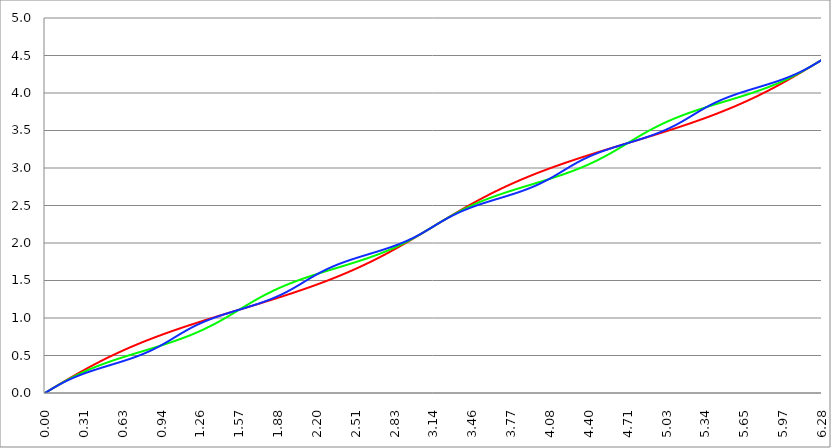
| Category | Series 1 | Series 0 | Series 2 |
|---|---|---|---|
| 0.0 | 0 | 0 | 0 |
| 0.00314159265358979 | 0.003 | 0.003 | 0.003 |
| 0.00628318530717958 | 0.006 | 0.006 | 0.006 |
| 0.00942477796076938 | 0.009 | 0.009 | 0.009 |
| 0.0125663706143592 | 0.013 | 0.013 | 0.013 |
| 0.015707963267949 | 0.016 | 0.016 | 0.016 |
| 0.0188495559215388 | 0.019 | 0.019 | 0.019 |
| 0.0219911485751285 | 0.022 | 0.022 | 0.022 |
| 0.0251327412287183 | 0.025 | 0.025 | 0.025 |
| 0.0282743338823081 | 0.028 | 0.028 | 0.028 |
| 0.0314159265358979 | 0.031 | 0.031 | 0.031 |
| 0.0345575191894877 | 0.035 | 0.035 | 0.034 |
| 0.0376991118430775 | 0.038 | 0.038 | 0.038 |
| 0.0408407044966673 | 0.041 | 0.041 | 0.041 |
| 0.0439822971502571 | 0.044 | 0.044 | 0.044 |
| 0.0471238898038469 | 0.047 | 0.047 | 0.047 |
| 0.0502654824574367 | 0.05 | 0.05 | 0.05 |
| 0.0534070751110265 | 0.053 | 0.053 | 0.053 |
| 0.0565486677646163 | 0.056 | 0.056 | 0.056 |
| 0.059690260418206 | 0.06 | 0.059 | 0.059 |
| 0.0628318530717958 | 0.063 | 0.063 | 0.062 |
| 0.0659734457253856 | 0.066 | 0.066 | 0.065 |
| 0.0691150383789754 | 0.069 | 0.069 | 0.068 |
| 0.0722566310325652 | 0.072 | 0.072 | 0.071 |
| 0.075398223686155 | 0.075 | 0.075 | 0.074 |
| 0.0785398163397448 | 0.078 | 0.078 | 0.077 |
| 0.0816814089933346 | 0.082 | 0.081 | 0.08 |
| 0.0848230016469244 | 0.085 | 0.084 | 0.083 |
| 0.0879645943005142 | 0.088 | 0.087 | 0.086 |
| 0.091106186954104 | 0.091 | 0.09 | 0.089 |
| 0.0942477796076937 | 0.094 | 0.093 | 0.092 |
| 0.0973893722612835 | 0.097 | 0.096 | 0.095 |
| 0.100530964914873 | 0.1 | 0.099 | 0.098 |
| 0.103672557568463 | 0.103 | 0.102 | 0.101 |
| 0.106814150222053 | 0.106 | 0.105 | 0.103 |
| 0.109955742875643 | 0.11 | 0.108 | 0.106 |
| 0.113097335529233 | 0.113 | 0.111 | 0.109 |
| 0.116238928182822 | 0.116 | 0.114 | 0.112 |
| 0.119380520836412 | 0.119 | 0.117 | 0.115 |
| 0.122522113490002 | 0.122 | 0.12 | 0.118 |
| 0.125663706143592 | 0.125 | 0.123 | 0.12 |
| 0.128805298797181 | 0.128 | 0.126 | 0.123 |
| 0.131946891450771 | 0.131 | 0.129 | 0.126 |
| 0.135088484104361 | 0.134 | 0.132 | 0.129 |
| 0.138230076757951 | 0.137 | 0.135 | 0.131 |
| 0.141371669411541 | 0.14 | 0.138 | 0.134 |
| 0.14451326206513 | 0.144 | 0.141 | 0.137 |
| 0.14765485471872 | 0.147 | 0.144 | 0.139 |
| 0.15079644737231 | 0.15 | 0.147 | 0.142 |
| 0.1539380400259 | 0.153 | 0.149 | 0.145 |
| 0.15707963267949 | 0.156 | 0.152 | 0.147 |
| 0.160221225333079 | 0.159 | 0.155 | 0.15 |
| 0.163362817986669 | 0.162 | 0.158 | 0.152 |
| 0.166504410640259 | 0.165 | 0.161 | 0.155 |
| 0.169646003293849 | 0.168 | 0.164 | 0.157 |
| 0.172787595947439 | 0.171 | 0.167 | 0.16 |
| 0.175929188601028 | 0.174 | 0.169 | 0.163 |
| 0.179070781254618 | 0.177 | 0.172 | 0.165 |
| 0.182212373908208 | 0.18 | 0.175 | 0.167 |
| 0.185353966561798 | 0.183 | 0.178 | 0.17 |
| 0.188495559215388 | 0.186 | 0.18 | 0.172 |
| 0.191637151868977 | 0.189 | 0.183 | 0.175 |
| 0.194778744522567 | 0.192 | 0.186 | 0.177 |
| 0.197920337176157 | 0.195 | 0.189 | 0.18 |
| 0.201061929829747 | 0.198 | 0.191 | 0.182 |
| 0.204203522483336 | 0.201 | 0.194 | 0.184 |
| 0.207345115136926 | 0.204 | 0.197 | 0.187 |
| 0.210486707790516 | 0.207 | 0.2 | 0.189 |
| 0.213628300444106 | 0.21 | 0.202 | 0.191 |
| 0.216769893097696 | 0.213 | 0.205 | 0.194 |
| 0.219911485751285 | 0.216 | 0.208 | 0.196 |
| 0.223053078404875 | 0.219 | 0.21 | 0.198 |
| 0.226194671058465 | 0.222 | 0.213 | 0.201 |
| 0.229336263712055 | 0.225 | 0.216 | 0.203 |
| 0.232477856365645 | 0.228 | 0.218 | 0.205 |
| 0.235619449019234 | 0.231 | 0.221 | 0.207 |
| 0.238761041672824 | 0.234 | 0.223 | 0.209 |
| 0.241902634326414 | 0.237 | 0.226 | 0.212 |
| 0.245044226980004 | 0.24 | 0.229 | 0.214 |
| 0.248185819633594 | 0.243 | 0.231 | 0.216 |
| 0.251327412287183 | 0.246 | 0.234 | 0.218 |
| 0.254469004940773 | 0.249 | 0.236 | 0.22 |
| 0.257610597594363 | 0.252 | 0.239 | 0.222 |
| 0.260752190247953 | 0.255 | 0.241 | 0.224 |
| 0.263893782901543 | 0.258 | 0.244 | 0.227 |
| 0.267035375555132 | 0.261 | 0.246 | 0.229 |
| 0.270176968208722 | 0.264 | 0.249 | 0.231 |
| 0.273318560862312 | 0.267 | 0.251 | 0.233 |
| 0.276460153515902 | 0.27 | 0.254 | 0.235 |
| 0.279601746169492 | 0.273 | 0.256 | 0.237 |
| 0.282743338823082 | 0.276 | 0.259 | 0.239 |
| 0.285884931476671 | 0.279 | 0.261 | 0.241 |
| 0.289026524130261 | 0.281 | 0.263 | 0.243 |
| 0.292168116783851 | 0.284 | 0.266 | 0.245 |
| 0.295309709437441 | 0.287 | 0.268 | 0.247 |
| 0.298451302091031 | 0.29 | 0.271 | 0.249 |
| 0.30159289474462 | 0.293 | 0.273 | 0.251 |
| 0.30473448739821 | 0.296 | 0.275 | 0.253 |
| 0.3078760800518 | 0.299 | 0.278 | 0.255 |
| 0.31101767270539 | 0.302 | 0.28 | 0.256 |
| 0.31415926535898 | 0.305 | 0.282 | 0.258 |
| 0.31730085801257 | 0.307 | 0.285 | 0.26 |
| 0.320442450666159 | 0.31 | 0.287 | 0.262 |
| 0.323584043319749 | 0.313 | 0.289 | 0.264 |
| 0.326725635973339 | 0.316 | 0.292 | 0.266 |
| 0.329867228626929 | 0.319 | 0.294 | 0.268 |
| 0.333008821280519 | 0.322 | 0.296 | 0.27 |
| 0.336150413934108 | 0.325 | 0.299 | 0.271 |
| 0.339292006587698 | 0.327 | 0.301 | 0.273 |
| 0.342433599241288 | 0.33 | 0.303 | 0.275 |
| 0.345575191894878 | 0.333 | 0.305 | 0.277 |
| 0.348716784548468 | 0.336 | 0.308 | 0.279 |
| 0.351858377202058 | 0.339 | 0.31 | 0.28 |
| 0.354999969855647 | 0.341 | 0.312 | 0.282 |
| 0.358141562509237 | 0.344 | 0.314 | 0.284 |
| 0.361283155162827 | 0.347 | 0.316 | 0.286 |
| 0.364424747816417 | 0.35 | 0.319 | 0.288 |
| 0.367566340470007 | 0.353 | 0.321 | 0.289 |
| 0.370707933123597 | 0.355 | 0.323 | 0.291 |
| 0.373849525777186 | 0.358 | 0.325 | 0.293 |
| 0.376991118430776 | 0.361 | 0.327 | 0.295 |
| 0.380132711084366 | 0.364 | 0.329 | 0.296 |
| 0.383274303737956 | 0.366 | 0.331 | 0.298 |
| 0.386415896391546 | 0.369 | 0.334 | 0.3 |
| 0.389557489045135 | 0.372 | 0.336 | 0.301 |
| 0.392699081698725 | 0.375 | 0.338 | 0.303 |
| 0.395840674352315 | 0.377 | 0.34 | 0.305 |
| 0.398982267005905 | 0.38 | 0.342 | 0.306 |
| 0.402123859659495 | 0.383 | 0.344 | 0.308 |
| 0.405265452313085 | 0.386 | 0.346 | 0.31 |
| 0.408407044966674 | 0.388 | 0.348 | 0.311 |
| 0.411548637620264 | 0.391 | 0.35 | 0.313 |
| 0.414690230273854 | 0.394 | 0.352 | 0.315 |
| 0.417831822927444 | 0.396 | 0.354 | 0.316 |
| 0.420973415581034 | 0.399 | 0.356 | 0.318 |
| 0.424115008234623 | 0.402 | 0.358 | 0.32 |
| 0.427256600888213 | 0.405 | 0.36 | 0.321 |
| 0.430398193541803 | 0.407 | 0.362 | 0.323 |
| 0.433539786195393 | 0.41 | 0.364 | 0.325 |
| 0.436681378848983 | 0.413 | 0.366 | 0.326 |
| 0.439822971502573 | 0.415 | 0.368 | 0.328 |
| 0.442964564156162 | 0.418 | 0.37 | 0.33 |
| 0.446106156809752 | 0.421 | 0.372 | 0.331 |
| 0.449247749463342 | 0.423 | 0.374 | 0.333 |
| 0.452389342116932 | 0.426 | 0.376 | 0.334 |
| 0.455530934770522 | 0.428 | 0.378 | 0.336 |
| 0.458672527424111 | 0.431 | 0.38 | 0.338 |
| 0.461814120077701 | 0.434 | 0.382 | 0.339 |
| 0.464955712731291 | 0.436 | 0.384 | 0.341 |
| 0.468097305384881 | 0.439 | 0.386 | 0.342 |
| 0.471238898038471 | 0.442 | 0.388 | 0.344 |
| 0.474380490692061 | 0.444 | 0.389 | 0.346 |
| 0.47752208334565 | 0.447 | 0.391 | 0.347 |
| 0.48066367599924 | 0.449 | 0.393 | 0.349 |
| 0.48380526865283 | 0.452 | 0.395 | 0.35 |
| 0.48694686130642 | 0.454 | 0.397 | 0.352 |
| 0.49008845396001 | 0.457 | 0.399 | 0.353 |
| 0.493230046613599 | 0.46 | 0.401 | 0.355 |
| 0.496371639267189 | 0.462 | 0.403 | 0.357 |
| 0.499513231920779 | 0.465 | 0.404 | 0.358 |
| 0.502654824574369 | 0.467 | 0.406 | 0.36 |
| 0.505796417227959 | 0.47 | 0.408 | 0.361 |
| 0.508938009881549 | 0.472 | 0.41 | 0.363 |
| 0.512079602535138 | 0.475 | 0.412 | 0.364 |
| 0.515221195188728 | 0.477 | 0.414 | 0.366 |
| 0.518362787842318 | 0.48 | 0.415 | 0.368 |
| 0.521504380495908 | 0.482 | 0.417 | 0.369 |
| 0.524645973149498 | 0.485 | 0.419 | 0.371 |
| 0.527787565803087 | 0.488 | 0.421 | 0.372 |
| 0.530929158456677 | 0.49 | 0.422 | 0.374 |
| 0.534070751110267 | 0.493 | 0.424 | 0.375 |
| 0.537212343763857 | 0.495 | 0.426 | 0.377 |
| 0.540353936417447 | 0.497 | 0.428 | 0.379 |
| 0.543495529071037 | 0.5 | 0.43 | 0.38 |
| 0.546637121724626 | 0.502 | 0.431 | 0.382 |
| 0.549778714378216 | 0.505 | 0.433 | 0.383 |
| 0.552920307031806 | 0.507 | 0.435 | 0.385 |
| 0.556061899685396 | 0.51 | 0.437 | 0.386 |
| 0.559203492338986 | 0.512 | 0.438 | 0.388 |
| 0.562345084992576 | 0.515 | 0.44 | 0.39 |
| 0.565486677646165 | 0.517 | 0.442 | 0.391 |
| 0.568628270299755 | 0.52 | 0.444 | 0.393 |
| 0.571769862953345 | 0.522 | 0.445 | 0.394 |
| 0.574911455606935 | 0.524 | 0.447 | 0.396 |
| 0.578053048260525 | 0.527 | 0.449 | 0.398 |
| 0.581194640914114 | 0.529 | 0.45 | 0.399 |
| 0.584336233567704 | 0.532 | 0.452 | 0.401 |
| 0.587477826221294 | 0.534 | 0.454 | 0.402 |
| 0.590619418874884 | 0.537 | 0.455 | 0.404 |
| 0.593761011528474 | 0.539 | 0.457 | 0.406 |
| 0.596902604182064 | 0.541 | 0.459 | 0.407 |
| 0.600044196835653 | 0.544 | 0.461 | 0.409 |
| 0.603185789489243 | 0.546 | 0.462 | 0.41 |
| 0.606327382142833 | 0.548 | 0.464 | 0.412 |
| 0.609468974796423 | 0.551 | 0.466 | 0.414 |
| 0.612610567450013 | 0.553 | 0.467 | 0.415 |
| 0.615752160103602 | 0.556 | 0.469 | 0.417 |
| 0.618893752757192 | 0.558 | 0.471 | 0.419 |
| 0.622035345410782 | 0.56 | 0.472 | 0.42 |
| 0.625176938064372 | 0.563 | 0.474 | 0.422 |
| 0.628318530717962 | 0.565 | 0.476 | 0.423 |
| 0.631460123371551 | 0.567 | 0.477 | 0.425 |
| 0.634601716025141 | 0.57 | 0.479 | 0.427 |
| 0.637743308678731 | 0.572 | 0.48 | 0.428 |
| 0.640884901332321 | 0.574 | 0.482 | 0.43 |
| 0.644026493985911 | 0.577 | 0.484 | 0.432 |
| 0.647168086639501 | 0.579 | 0.485 | 0.433 |
| 0.65030967929309 | 0.581 | 0.487 | 0.435 |
| 0.65345127194668 | 0.583 | 0.489 | 0.437 |
| 0.65659286460027 | 0.586 | 0.49 | 0.439 |
| 0.65973445725386 | 0.588 | 0.492 | 0.44 |
| 0.66287604990745 | 0.59 | 0.493 | 0.442 |
| 0.666017642561039 | 0.593 | 0.495 | 0.444 |
| 0.669159235214629 | 0.595 | 0.497 | 0.445 |
| 0.672300827868219 | 0.597 | 0.498 | 0.447 |
| 0.675442420521809 | 0.599 | 0.5 | 0.449 |
| 0.678584013175399 | 0.602 | 0.502 | 0.451 |
| 0.681725605828989 | 0.604 | 0.503 | 0.452 |
| 0.684867198482578 | 0.606 | 0.505 | 0.454 |
| 0.688008791136168 | 0.608 | 0.506 | 0.456 |
| 0.691150383789758 | 0.611 | 0.508 | 0.458 |
| 0.694291976443348 | 0.613 | 0.51 | 0.459 |
| 0.697433569096938 | 0.615 | 0.511 | 0.461 |
| 0.700575161750528 | 0.617 | 0.513 | 0.463 |
| 0.703716754404117 | 0.62 | 0.514 | 0.465 |
| 0.706858347057707 | 0.622 | 0.516 | 0.467 |
| 0.709999939711297 | 0.624 | 0.518 | 0.468 |
| 0.713141532364887 | 0.626 | 0.519 | 0.47 |
| 0.716283125018477 | 0.628 | 0.521 | 0.472 |
| 0.719424717672066 | 0.631 | 0.522 | 0.474 |
| 0.722566310325656 | 0.633 | 0.524 | 0.476 |
| 0.725707902979246 | 0.635 | 0.525 | 0.478 |
| 0.728849495632836 | 0.637 | 0.527 | 0.48 |
| 0.731991088286426 | 0.639 | 0.529 | 0.481 |
| 0.735132680940016 | 0.641 | 0.53 | 0.483 |
| 0.738274273593605 | 0.644 | 0.532 | 0.485 |
| 0.741415866247195 | 0.646 | 0.533 | 0.487 |
| 0.744557458900785 | 0.648 | 0.535 | 0.489 |
| 0.747699051554375 | 0.65 | 0.536 | 0.491 |
| 0.750840644207965 | 0.652 | 0.538 | 0.493 |
| 0.753982236861554 | 0.654 | 0.54 | 0.495 |
| 0.757123829515144 | 0.656 | 0.541 | 0.497 |
| 0.760265422168734 | 0.659 | 0.543 | 0.499 |
| 0.763407014822324 | 0.661 | 0.544 | 0.501 |
| 0.766548607475914 | 0.663 | 0.546 | 0.503 |
| 0.769690200129504 | 0.665 | 0.548 | 0.505 |
| 0.772831792783093 | 0.667 | 0.549 | 0.507 |
| 0.775973385436683 | 0.669 | 0.551 | 0.509 |
| 0.779114978090273 | 0.671 | 0.552 | 0.511 |
| 0.782256570743863 | 0.673 | 0.554 | 0.513 |
| 0.785398163397453 | 0.676 | 0.555 | 0.515 |
| 0.788539756051042 | 0.678 | 0.557 | 0.517 |
| 0.791681348704632 | 0.68 | 0.559 | 0.52 |
| 0.794822941358222 | 0.682 | 0.56 | 0.522 |
| 0.797964534011812 | 0.684 | 0.562 | 0.524 |
| 0.801106126665402 | 0.686 | 0.563 | 0.526 |
| 0.804247719318992 | 0.688 | 0.565 | 0.528 |
| 0.807389311972581 | 0.69 | 0.566 | 0.53 |
| 0.810530904626171 | 0.692 | 0.568 | 0.533 |
| 0.813672497279761 | 0.694 | 0.57 | 0.535 |
| 0.816814089933351 | 0.696 | 0.571 | 0.537 |
| 0.819955682586941 | 0.698 | 0.573 | 0.539 |
| 0.823097275240531 | 0.7 | 0.574 | 0.541 |
| 0.82623886789412 | 0.702 | 0.576 | 0.544 |
| 0.82938046054771 | 0.704 | 0.577 | 0.546 |
| 0.8325220532013 | 0.706 | 0.579 | 0.548 |
| 0.83566364585489 | 0.708 | 0.581 | 0.551 |
| 0.83880523850848 | 0.71 | 0.582 | 0.553 |
| 0.841946831162069 | 0.713 | 0.584 | 0.555 |
| 0.845088423815659 | 0.715 | 0.585 | 0.558 |
| 0.848230016469249 | 0.717 | 0.587 | 0.56 |
| 0.851371609122839 | 0.719 | 0.588 | 0.562 |
| 0.854513201776429 | 0.721 | 0.59 | 0.565 |
| 0.857654794430019 | 0.723 | 0.592 | 0.567 |
| 0.860796387083608 | 0.725 | 0.593 | 0.57 |
| 0.863937979737198 | 0.727 | 0.595 | 0.572 |
| 0.867079572390788 | 0.729 | 0.596 | 0.575 |
| 0.870221165044378 | 0.731 | 0.598 | 0.577 |
| 0.873362757697968 | 0.733 | 0.6 | 0.58 |
| 0.876504350351557 | 0.734 | 0.601 | 0.582 |
| 0.879645943005147 | 0.736 | 0.603 | 0.585 |
| 0.882787535658737 | 0.738 | 0.604 | 0.587 |
| 0.885929128312327 | 0.74 | 0.606 | 0.59 |
| 0.889070720965917 | 0.742 | 0.608 | 0.592 |
| 0.892212313619507 | 0.744 | 0.609 | 0.595 |
| 0.895353906273096 | 0.746 | 0.611 | 0.598 |
| 0.898495498926686 | 0.748 | 0.612 | 0.6 |
| 0.901637091580276 | 0.75 | 0.614 | 0.603 |
| 0.904778684233866 | 0.752 | 0.616 | 0.606 |
| 0.907920276887456 | 0.754 | 0.617 | 0.608 |
| 0.911061869541045 | 0.756 | 0.619 | 0.611 |
| 0.914203462194635 | 0.758 | 0.62 | 0.614 |
| 0.917345054848225 | 0.76 | 0.622 | 0.616 |
| 0.920486647501815 | 0.762 | 0.624 | 0.619 |
| 0.923628240155405 | 0.764 | 0.625 | 0.622 |
| 0.926769832808995 | 0.766 | 0.627 | 0.625 |
| 0.929911425462584 | 0.768 | 0.629 | 0.628 |
| 0.933053018116174 | 0.769 | 0.63 | 0.63 |
| 0.936194610769764 | 0.771 | 0.632 | 0.633 |
| 0.939336203423354 | 0.773 | 0.634 | 0.636 |
| 0.942477796076944 | 0.775 | 0.635 | 0.639 |
| 0.945619388730533 | 0.777 | 0.637 | 0.642 |
| 0.948760981384123 | 0.779 | 0.639 | 0.645 |
| 0.951902574037713 | 0.781 | 0.64 | 0.648 |
| 0.955044166691303 | 0.783 | 0.642 | 0.651 |
| 0.958185759344893 | 0.785 | 0.643 | 0.653 |
| 0.961327351998483 | 0.786 | 0.645 | 0.656 |
| 0.964468944652072 | 0.788 | 0.647 | 0.659 |
| 0.967610537305662 | 0.79 | 0.649 | 0.662 |
| 0.970752129959252 | 0.792 | 0.65 | 0.665 |
| 0.973893722612842 | 0.794 | 0.652 | 0.668 |
| 0.977035315266432 | 0.796 | 0.654 | 0.671 |
| 0.980176907920022 | 0.798 | 0.655 | 0.674 |
| 0.983318500573611 | 0.8 | 0.657 | 0.677 |
| 0.986460093227201 | 0.801 | 0.659 | 0.68 |
| 0.989601685880791 | 0.803 | 0.66 | 0.683 |
| 0.992743278534381 | 0.805 | 0.662 | 0.687 |
| 0.995884871187971 | 0.807 | 0.664 | 0.69 |
| 0.99902646384156 | 0.809 | 0.665 | 0.693 |
| 1.00216805649515 | 0.811 | 0.667 | 0.696 |
| 1.00530964914874 | 0.812 | 0.669 | 0.699 |
| 1.00845124180233 | 0.814 | 0.671 | 0.702 |
| 1.01159283445592 | 0.816 | 0.672 | 0.705 |
| 1.01473442710951 | 0.818 | 0.674 | 0.708 |
| 1.017876019763099 | 0.82 | 0.676 | 0.711 |
| 1.021017612416689 | 0.822 | 0.678 | 0.714 |
| 1.02415920507028 | 0.823 | 0.679 | 0.717 |
| 1.027300797723869 | 0.825 | 0.681 | 0.721 |
| 1.030442390377459 | 0.827 | 0.683 | 0.724 |
| 1.033583983031048 | 0.829 | 0.685 | 0.727 |
| 1.036725575684638 | 0.831 | 0.686 | 0.73 |
| 1.039867168338228 | 0.832 | 0.688 | 0.733 |
| 1.043008760991818 | 0.834 | 0.69 | 0.736 |
| 1.046150353645408 | 0.836 | 0.692 | 0.739 |
| 1.049291946298998 | 0.838 | 0.694 | 0.743 |
| 1.052433538952587 | 0.84 | 0.695 | 0.746 |
| 1.055575131606177 | 0.841 | 0.697 | 0.749 |
| 1.058716724259767 | 0.843 | 0.699 | 0.752 |
| 1.061858316913357 | 0.845 | 0.701 | 0.755 |
| 1.064999909566947 | 0.847 | 0.703 | 0.758 |
| 1.068141502220536 | 0.849 | 0.704 | 0.761 |
| 1.071283094874126 | 0.85 | 0.706 | 0.765 |
| 1.074424687527716 | 0.852 | 0.708 | 0.768 |
| 1.077566280181306 | 0.854 | 0.71 | 0.771 |
| 1.080707872834896 | 0.856 | 0.712 | 0.774 |
| 1.083849465488486 | 0.857 | 0.714 | 0.777 |
| 1.086991058142075 | 0.859 | 0.716 | 0.78 |
| 1.090132650795665 | 0.861 | 0.717 | 0.783 |
| 1.093274243449255 | 0.863 | 0.719 | 0.786 |
| 1.096415836102845 | 0.864 | 0.721 | 0.789 |
| 1.099557428756435 | 0.866 | 0.723 | 0.792 |
| 1.102699021410025 | 0.868 | 0.725 | 0.795 |
| 1.105840614063614 | 0.87 | 0.727 | 0.799 |
| 1.108982206717204 | 0.871 | 0.729 | 0.802 |
| 1.112123799370794 | 0.873 | 0.731 | 0.805 |
| 1.115265392024384 | 0.875 | 0.733 | 0.808 |
| 1.118406984677974 | 0.877 | 0.735 | 0.811 |
| 1.121548577331563 | 0.878 | 0.737 | 0.814 |
| 1.124690169985153 | 0.88 | 0.739 | 0.817 |
| 1.127831762638743 | 0.882 | 0.741 | 0.82 |
| 1.130973355292333 | 0.884 | 0.742 | 0.823 |
| 1.134114947945923 | 0.885 | 0.744 | 0.826 |
| 1.137256540599513 | 0.887 | 0.746 | 0.828 |
| 1.140398133253102 | 0.889 | 0.748 | 0.831 |
| 1.143539725906692 | 0.89 | 0.75 | 0.834 |
| 1.146681318560282 | 0.892 | 0.752 | 0.837 |
| 1.149822911213872 | 0.894 | 0.754 | 0.84 |
| 1.152964503867462 | 0.896 | 0.756 | 0.843 |
| 1.156106096521051 | 0.897 | 0.759 | 0.846 |
| 1.159247689174641 | 0.899 | 0.761 | 0.849 |
| 1.162389281828231 | 0.901 | 0.763 | 0.851 |
| 1.165530874481821 | 0.902 | 0.765 | 0.854 |
| 1.168672467135411 | 0.904 | 0.767 | 0.857 |
| 1.171814059789001 | 0.906 | 0.769 | 0.86 |
| 1.17495565244259 | 0.908 | 0.771 | 0.863 |
| 1.17809724509618 | 0.909 | 0.773 | 0.865 |
| 1.18123883774977 | 0.911 | 0.775 | 0.868 |
| 1.18438043040336 | 0.913 | 0.777 | 0.871 |
| 1.18752202305695 | 0.914 | 0.779 | 0.874 |
| 1.190663615710539 | 0.916 | 0.781 | 0.876 |
| 1.193805208364129 | 0.918 | 0.784 | 0.879 |
| 1.19694680101772 | 0.919 | 0.786 | 0.882 |
| 1.200088393671309 | 0.921 | 0.788 | 0.884 |
| 1.203229986324899 | 0.923 | 0.79 | 0.887 |
| 1.206371578978489 | 0.924 | 0.792 | 0.889 |
| 1.209513171632078 | 0.926 | 0.794 | 0.892 |
| 1.212654764285668 | 0.928 | 0.797 | 0.895 |
| 1.215796356939258 | 0.929 | 0.799 | 0.897 |
| 1.218937949592848 | 0.931 | 0.801 | 0.9 |
| 1.222079542246438 | 0.933 | 0.803 | 0.902 |
| 1.225221134900027 | 0.934 | 0.805 | 0.905 |
| 1.228362727553617 | 0.936 | 0.808 | 0.907 |
| 1.231504320207207 | 0.938 | 0.81 | 0.91 |
| 1.234645912860797 | 0.939 | 0.812 | 0.912 |
| 1.237787505514387 | 0.941 | 0.814 | 0.915 |
| 1.240929098167977 | 0.943 | 0.817 | 0.917 |
| 1.244070690821566 | 0.944 | 0.819 | 0.919 |
| 1.247212283475156 | 0.946 | 0.821 | 0.922 |
| 1.250353876128746 | 0.948 | 0.824 | 0.924 |
| 1.253495468782336 | 0.949 | 0.826 | 0.926 |
| 1.256637061435926 | 0.951 | 0.828 | 0.929 |
| 1.259778654089515 | 0.953 | 0.831 | 0.931 |
| 1.262920246743105 | 0.954 | 0.833 | 0.933 |
| 1.266061839396695 | 0.956 | 0.835 | 0.936 |
| 1.269203432050285 | 0.958 | 0.838 | 0.938 |
| 1.272345024703875 | 0.959 | 0.84 | 0.94 |
| 1.275486617357465 | 0.961 | 0.842 | 0.943 |
| 1.278628210011054 | 0.963 | 0.845 | 0.945 |
| 1.281769802664644 | 0.964 | 0.847 | 0.947 |
| 1.284911395318234 | 0.966 | 0.85 | 0.949 |
| 1.288052987971824 | 0.967 | 0.852 | 0.951 |
| 1.291194580625414 | 0.969 | 0.855 | 0.954 |
| 1.294336173279003 | 0.971 | 0.857 | 0.956 |
| 1.297477765932593 | 0.972 | 0.859 | 0.958 |
| 1.300619358586183 | 0.974 | 0.862 | 0.96 |
| 1.303760951239773 | 0.976 | 0.864 | 0.962 |
| 1.306902543893363 | 0.977 | 0.867 | 0.964 |
| 1.310044136546953 | 0.979 | 0.869 | 0.966 |
| 1.313185729200542 | 0.98 | 0.872 | 0.968 |
| 1.316327321854132 | 0.982 | 0.875 | 0.971 |
| 1.319468914507722 | 0.984 | 0.877 | 0.973 |
| 1.322610507161312 | 0.985 | 0.88 | 0.975 |
| 1.325752099814902 | 0.987 | 0.882 | 0.977 |
| 1.328893692468491 | 0.989 | 0.885 | 0.979 |
| 1.332035285122081 | 0.99 | 0.887 | 0.981 |
| 1.335176877775671 | 0.992 | 0.89 | 0.983 |
| 1.338318470429261 | 0.993 | 0.893 | 0.985 |
| 1.341460063082851 | 0.995 | 0.895 | 0.987 |
| 1.344601655736441 | 0.997 | 0.898 | 0.989 |
| 1.34774324839003 | 0.998 | 0.9 | 0.991 |
| 1.35088484104362 | 1 | 0.903 | 0.992 |
| 1.35402643369721 | 1.001 | 0.906 | 0.994 |
| 1.3571680263508 | 1.003 | 0.908 | 0.996 |
| 1.36030961900439 | 1.005 | 0.911 | 0.998 |
| 1.363451211657979 | 1.006 | 0.914 | 1 |
| 1.36659280431157 | 1.008 | 0.917 | 1.002 |
| 1.369734396965159 | 1.01 | 0.919 | 1.004 |
| 1.372875989618749 | 1.011 | 0.922 | 1.006 |
| 1.376017582272339 | 1.013 | 0.925 | 1.008 |
| 1.379159174925929 | 1.014 | 0.927 | 1.009 |
| 1.382300767579518 | 1.016 | 0.93 | 1.011 |
| 1.385442360233108 | 1.018 | 0.933 | 1.013 |
| 1.388583952886698 | 1.019 | 0.936 | 1.015 |
| 1.391725545540288 | 1.021 | 0.939 | 1.017 |
| 1.394867138193878 | 1.022 | 0.941 | 1.019 |
| 1.398008730847468 | 1.024 | 0.944 | 1.02 |
| 1.401150323501057 | 1.025 | 0.947 | 1.022 |
| 1.404291916154647 | 1.027 | 0.95 | 1.024 |
| 1.407433508808237 | 1.029 | 0.953 | 1.026 |
| 1.410575101461827 | 1.03 | 0.956 | 1.027 |
| 1.413716694115417 | 1.032 | 0.958 | 1.029 |
| 1.416858286769006 | 1.033 | 0.961 | 1.031 |
| 1.419999879422596 | 1.035 | 0.964 | 1.033 |
| 1.423141472076186 | 1.037 | 0.967 | 1.034 |
| 1.426283064729776 | 1.038 | 0.97 | 1.036 |
| 1.429424657383366 | 1.04 | 0.973 | 1.038 |
| 1.432566250036956 | 1.041 | 0.976 | 1.04 |
| 1.435707842690545 | 1.043 | 0.979 | 1.041 |
| 1.438849435344135 | 1.045 | 0.982 | 1.043 |
| 1.441991027997725 | 1.046 | 0.985 | 1.045 |
| 1.445132620651315 | 1.048 | 0.988 | 1.046 |
| 1.448274213304905 | 1.049 | 0.991 | 1.048 |
| 1.451415805958494 | 1.051 | 0.994 | 1.05 |
| 1.454557398612084 | 1.052 | 0.996 | 1.051 |
| 1.457698991265674 | 1.054 | 0.999 | 1.053 |
| 1.460840583919264 | 1.056 | 1.002 | 1.055 |
| 1.463982176572854 | 1.057 | 1.005 | 1.056 |
| 1.467123769226444 | 1.059 | 1.008 | 1.058 |
| 1.470265361880033 | 1.06 | 1.012 | 1.06 |
| 1.473406954533623 | 1.062 | 1.015 | 1.061 |
| 1.476548547187213 | 1.064 | 1.018 | 1.063 |
| 1.479690139840803 | 1.065 | 1.021 | 1.065 |
| 1.482831732494393 | 1.067 | 1.024 | 1.066 |
| 1.485973325147982 | 1.068 | 1.027 | 1.068 |
| 1.489114917801572 | 1.07 | 1.03 | 1.069 |
| 1.492256510455162 | 1.071 | 1.033 | 1.071 |
| 1.495398103108752 | 1.073 | 1.036 | 1.073 |
| 1.498539695762342 | 1.075 | 1.039 | 1.074 |
| 1.501681288415932 | 1.076 | 1.042 | 1.076 |
| 1.504822881069521 | 1.078 | 1.045 | 1.078 |
| 1.507964473723111 | 1.079 | 1.048 | 1.079 |
| 1.511106066376701 | 1.081 | 1.051 | 1.081 |
| 1.514247659030291 | 1.082 | 1.054 | 1.082 |
| 1.517389251683881 | 1.084 | 1.058 | 1.084 |
| 1.520530844337471 | 1.086 | 1.061 | 1.085 |
| 1.52367243699106 | 1.087 | 1.064 | 1.087 |
| 1.52681402964465 | 1.089 | 1.067 | 1.089 |
| 1.52995562229824 | 1.09 | 1.07 | 1.09 |
| 1.53309721495183 | 1.092 | 1.073 | 1.092 |
| 1.53623880760542 | 1.093 | 1.076 | 1.093 |
| 1.539380400259009 | 1.095 | 1.079 | 1.095 |
| 1.542521992912599 | 1.097 | 1.082 | 1.097 |
| 1.545663585566189 | 1.098 | 1.086 | 1.098 |
| 1.548805178219779 | 1.1 | 1.089 | 1.1 |
| 1.551946770873369 | 1.101 | 1.092 | 1.101 |
| 1.555088363526959 | 1.103 | 1.095 | 1.103 |
| 1.558229956180548 | 1.104 | 1.098 | 1.104 |
| 1.561371548834138 | 1.106 | 1.101 | 1.106 |
| 1.564513141487728 | 1.108 | 1.104 | 1.108 |
| 1.567654734141318 | 1.109 | 1.108 | 1.109 |
| 1.570796326794908 | 1.111 | 1.111 | 1.111 |
| 1.573937919448497 | 1.112 | 1.114 | 1.112 |
| 1.577079512102087 | 1.114 | 1.117 | 1.114 |
| 1.580221104755677 | 1.115 | 1.12 | 1.115 |
| 1.583362697409267 | 1.117 | 1.123 | 1.117 |
| 1.586504290062857 | 1.119 | 1.126 | 1.119 |
| 1.589645882716447 | 1.12 | 1.13 | 1.12 |
| 1.592787475370036 | 1.122 | 1.133 | 1.122 |
| 1.595929068023626 | 1.123 | 1.136 | 1.123 |
| 1.599070660677216 | 1.125 | 1.139 | 1.125 |
| 1.602212253330806 | 1.126 | 1.142 | 1.126 |
| 1.605353845984396 | 1.128 | 1.145 | 1.128 |
| 1.608495438637985 | 1.13 | 1.148 | 1.13 |
| 1.611637031291575 | 1.131 | 1.151 | 1.131 |
| 1.614778623945165 | 1.133 | 1.155 | 1.133 |
| 1.617920216598755 | 1.134 | 1.158 | 1.134 |
| 1.621061809252345 | 1.136 | 1.161 | 1.136 |
| 1.624203401905935 | 1.137 | 1.164 | 1.138 |
| 1.627344994559524 | 1.139 | 1.167 | 1.139 |
| 1.630486587213114 | 1.141 | 1.17 | 1.141 |
| 1.633628179866704 | 1.142 | 1.173 | 1.142 |
| 1.636769772520294 | 1.144 | 1.176 | 1.144 |
| 1.639911365173884 | 1.145 | 1.179 | 1.146 |
| 1.643052957827473 | 1.147 | 1.182 | 1.147 |
| 1.646194550481063 | 1.148 | 1.186 | 1.149 |
| 1.649336143134653 | 1.15 | 1.189 | 1.15 |
| 1.652477735788243 | 1.152 | 1.192 | 1.152 |
| 1.655619328441833 | 1.153 | 1.195 | 1.154 |
| 1.658760921095423 | 1.155 | 1.198 | 1.155 |
| 1.661902513749012 | 1.156 | 1.201 | 1.157 |
| 1.665044106402602 | 1.158 | 1.204 | 1.158 |
| 1.668185699056192 | 1.159 | 1.207 | 1.16 |
| 1.671327291709782 | 1.161 | 1.21 | 1.162 |
| 1.674468884363372 | 1.163 | 1.213 | 1.163 |
| 1.677610477016961 | 1.164 | 1.216 | 1.165 |
| 1.680752069670551 | 1.166 | 1.219 | 1.167 |
| 1.683893662324141 | 1.167 | 1.222 | 1.168 |
| 1.687035254977731 | 1.169 | 1.225 | 1.17 |
| 1.690176847631321 | 1.171 | 1.228 | 1.172 |
| 1.693318440284911 | 1.172 | 1.231 | 1.173 |
| 1.6964600329385 | 1.174 | 1.234 | 1.175 |
| 1.69960162559209 | 1.175 | 1.237 | 1.177 |
| 1.70274321824568 | 1.177 | 1.24 | 1.178 |
| 1.70588481089927 | 1.178 | 1.243 | 1.18 |
| 1.70902640355286 | 1.18 | 1.246 | 1.182 |
| 1.712167996206449 | 1.182 | 1.249 | 1.184 |
| 1.715309588860039 | 1.183 | 1.251 | 1.185 |
| 1.71845118151363 | 1.185 | 1.254 | 1.187 |
| 1.721592774167219 | 1.186 | 1.257 | 1.189 |
| 1.724734366820809 | 1.188 | 1.26 | 1.19 |
| 1.727875959474399 | 1.19 | 1.263 | 1.192 |
| 1.731017552127988 | 1.191 | 1.266 | 1.194 |
| 1.734159144781578 | 1.193 | 1.269 | 1.196 |
| 1.737300737435168 | 1.194 | 1.272 | 1.198 |
| 1.740442330088758 | 1.196 | 1.274 | 1.199 |
| 1.743583922742348 | 1.198 | 1.277 | 1.201 |
| 1.746725515395937 | 1.199 | 1.28 | 1.203 |
| 1.749867108049527 | 1.201 | 1.283 | 1.205 |
| 1.753008700703117 | 1.202 | 1.286 | 1.206 |
| 1.756150293356707 | 1.204 | 1.288 | 1.208 |
| 1.759291886010297 | 1.206 | 1.291 | 1.21 |
| 1.762433478663887 | 1.207 | 1.294 | 1.212 |
| 1.765575071317476 | 1.209 | 1.297 | 1.214 |
| 1.768716663971066 | 1.21 | 1.299 | 1.216 |
| 1.771858256624656 | 1.212 | 1.302 | 1.218 |
| 1.774999849278246 | 1.214 | 1.305 | 1.219 |
| 1.778141441931836 | 1.215 | 1.308 | 1.221 |
| 1.781283034585426 | 1.217 | 1.31 | 1.223 |
| 1.784424627239015 | 1.218 | 1.313 | 1.225 |
| 1.787566219892605 | 1.22 | 1.316 | 1.227 |
| 1.790707812546195 | 1.222 | 1.318 | 1.229 |
| 1.793849405199785 | 1.223 | 1.321 | 1.231 |
| 1.796990997853375 | 1.225 | 1.324 | 1.233 |
| 1.800132590506964 | 1.226 | 1.326 | 1.235 |
| 1.803274183160554 | 1.228 | 1.329 | 1.237 |
| 1.806415775814144 | 1.23 | 1.331 | 1.239 |
| 1.809557368467734 | 1.231 | 1.334 | 1.241 |
| 1.812698961121324 | 1.233 | 1.337 | 1.243 |
| 1.815840553774914 | 1.234 | 1.339 | 1.245 |
| 1.818982146428503 | 1.236 | 1.342 | 1.247 |
| 1.822123739082093 | 1.238 | 1.344 | 1.249 |
| 1.825265331735683 | 1.239 | 1.347 | 1.251 |
| 1.828406924389273 | 1.241 | 1.349 | 1.253 |
| 1.831548517042863 | 1.243 | 1.352 | 1.255 |
| 1.834690109696452 | 1.244 | 1.354 | 1.257 |
| 1.837831702350042 | 1.246 | 1.357 | 1.259 |
| 1.840973295003632 | 1.247 | 1.359 | 1.261 |
| 1.844114887657222 | 1.249 | 1.362 | 1.264 |
| 1.847256480310812 | 1.251 | 1.364 | 1.266 |
| 1.850398072964402 | 1.252 | 1.367 | 1.268 |
| 1.853539665617991 | 1.254 | 1.369 | 1.27 |
| 1.856681258271581 | 1.256 | 1.372 | 1.272 |
| 1.859822850925171 | 1.257 | 1.374 | 1.274 |
| 1.862964443578761 | 1.259 | 1.377 | 1.277 |
| 1.866106036232351 | 1.261 | 1.379 | 1.279 |
| 1.86924762888594 | 1.262 | 1.381 | 1.281 |
| 1.87238922153953 | 1.264 | 1.384 | 1.283 |
| 1.87553081419312 | 1.265 | 1.386 | 1.286 |
| 1.87867240684671 | 1.267 | 1.389 | 1.288 |
| 1.8818139995003 | 1.269 | 1.391 | 1.29 |
| 1.88495559215389 | 1.27 | 1.393 | 1.293 |
| 1.888097184807479 | 1.272 | 1.396 | 1.295 |
| 1.891238777461069 | 1.274 | 1.398 | 1.297 |
| 1.89438037011466 | 1.275 | 1.4 | 1.3 |
| 1.897521962768249 | 1.277 | 1.402 | 1.302 |
| 1.900663555421839 | 1.279 | 1.405 | 1.305 |
| 1.903805148075429 | 1.28 | 1.407 | 1.307 |
| 1.906946740729018 | 1.282 | 1.409 | 1.309 |
| 1.910088333382608 | 1.284 | 1.412 | 1.312 |
| 1.913229926036198 | 1.285 | 1.414 | 1.314 |
| 1.916371518689788 | 1.287 | 1.416 | 1.317 |
| 1.919513111343378 | 1.289 | 1.418 | 1.319 |
| 1.922654703996967 | 1.29 | 1.42 | 1.322 |
| 1.925796296650557 | 1.292 | 1.423 | 1.324 |
| 1.928937889304147 | 1.294 | 1.425 | 1.327 |
| 1.932079481957737 | 1.295 | 1.427 | 1.329 |
| 1.935221074611327 | 1.297 | 1.429 | 1.332 |
| 1.938362667264917 | 1.299 | 1.431 | 1.335 |
| 1.941504259918506 | 1.3 | 1.434 | 1.337 |
| 1.944645852572096 | 1.302 | 1.436 | 1.34 |
| 1.947787445225686 | 1.304 | 1.438 | 1.343 |
| 1.950929037879276 | 1.305 | 1.44 | 1.345 |
| 1.954070630532866 | 1.307 | 1.442 | 1.348 |
| 1.957212223186455 | 1.309 | 1.444 | 1.351 |
| 1.960353815840045 | 1.31 | 1.446 | 1.353 |
| 1.963495408493635 | 1.312 | 1.448 | 1.356 |
| 1.966637001147225 | 1.314 | 1.451 | 1.359 |
| 1.969778593800815 | 1.316 | 1.453 | 1.362 |
| 1.972920186454405 | 1.317 | 1.455 | 1.364 |
| 1.976061779107994 | 1.319 | 1.457 | 1.367 |
| 1.979203371761584 | 1.321 | 1.459 | 1.37 |
| 1.982344964415174 | 1.322 | 1.461 | 1.373 |
| 1.985486557068764 | 1.324 | 1.463 | 1.376 |
| 1.988628149722354 | 1.326 | 1.465 | 1.378 |
| 1.991769742375943 | 1.328 | 1.467 | 1.381 |
| 1.994911335029533 | 1.329 | 1.469 | 1.384 |
| 1.998052927683123 | 1.331 | 1.471 | 1.387 |
| 2.001194520336712 | 1.333 | 1.473 | 1.39 |
| 2.004336112990302 | 1.334 | 1.475 | 1.393 |
| 2.007477705643892 | 1.336 | 1.477 | 1.396 |
| 2.010619298297482 | 1.338 | 1.479 | 1.399 |
| 2.013760890951071 | 1.34 | 1.481 | 1.402 |
| 2.016902483604661 | 1.341 | 1.483 | 1.405 |
| 2.02004407625825 | 1.343 | 1.485 | 1.408 |
| 2.02318566891184 | 1.345 | 1.487 | 1.411 |
| 2.02632726156543 | 1.347 | 1.489 | 1.414 |
| 2.029468854219019 | 1.348 | 1.491 | 1.417 |
| 2.032610446872609 | 1.35 | 1.493 | 1.42 |
| 2.035752039526198 | 1.352 | 1.494 | 1.423 |
| 2.038893632179788 | 1.353 | 1.496 | 1.426 |
| 2.042035224833378 | 1.355 | 1.498 | 1.429 |
| 2.045176817486967 | 1.357 | 1.5 | 1.432 |
| 2.048318410140557 | 1.359 | 1.502 | 1.435 |
| 2.051460002794146 | 1.361 | 1.504 | 1.438 |
| 2.054601595447736 | 1.362 | 1.506 | 1.441 |
| 2.057743188101325 | 1.364 | 1.508 | 1.444 |
| 2.060884780754915 | 1.366 | 1.51 | 1.448 |
| 2.064026373408505 | 1.368 | 1.511 | 1.451 |
| 2.067167966062094 | 1.369 | 1.513 | 1.454 |
| 2.070309558715684 | 1.371 | 1.515 | 1.457 |
| 2.073451151369273 | 1.373 | 1.517 | 1.46 |
| 2.076592744022863 | 1.375 | 1.519 | 1.463 |
| 2.079734336676452 | 1.376 | 1.521 | 1.466 |
| 2.082875929330042 | 1.378 | 1.522 | 1.469 |
| 2.086017521983632 | 1.38 | 1.524 | 1.473 |
| 2.089159114637221 | 1.382 | 1.526 | 1.476 |
| 2.092300707290811 | 1.384 | 1.528 | 1.479 |
| 2.095442299944401 | 1.385 | 1.53 | 1.482 |
| 2.09858389259799 | 1.387 | 1.531 | 1.485 |
| 2.10172548525158 | 1.389 | 1.533 | 1.488 |
| 2.104867077905169 | 1.391 | 1.535 | 1.491 |
| 2.108008670558759 | 1.393 | 1.537 | 1.495 |
| 2.111150263212349 | 1.394 | 1.539 | 1.498 |
| 2.114291855865938 | 1.396 | 1.54 | 1.501 |
| 2.117433448519528 | 1.398 | 1.542 | 1.504 |
| 2.120575041173117 | 1.4 | 1.544 | 1.507 |
| 2.123716633826707 | 1.402 | 1.546 | 1.51 |
| 2.126858226480297 | 1.403 | 1.547 | 1.513 |
| 2.129999819133886 | 1.405 | 1.549 | 1.516 |
| 2.133141411787476 | 1.407 | 1.551 | 1.52 |
| 2.136283004441065 | 1.409 | 1.553 | 1.523 |
| 2.139424597094655 | 1.411 | 1.554 | 1.526 |
| 2.142566189748245 | 1.413 | 1.556 | 1.529 |
| 2.145707782401834 | 1.415 | 1.558 | 1.532 |
| 2.148849375055424 | 1.416 | 1.559 | 1.535 |
| 2.151990967709013 | 1.418 | 1.561 | 1.538 |
| 2.155132560362603 | 1.42 | 1.563 | 1.541 |
| 2.158274153016193 | 1.422 | 1.564 | 1.544 |
| 2.161415745669782 | 1.424 | 1.566 | 1.547 |
| 2.164557338323372 | 1.426 | 1.568 | 1.55 |
| 2.167698930976961 | 1.427 | 1.57 | 1.553 |
| 2.170840523630551 | 1.429 | 1.571 | 1.556 |
| 2.173982116284141 | 1.431 | 1.573 | 1.559 |
| 2.17712370893773 | 1.433 | 1.575 | 1.562 |
| 2.18026530159132 | 1.435 | 1.576 | 1.565 |
| 2.183406894244909 | 1.437 | 1.578 | 1.568 |
| 2.186548486898499 | 1.439 | 1.58 | 1.571 |
| 2.189690079552089 | 1.441 | 1.581 | 1.574 |
| 2.192831672205678 | 1.443 | 1.583 | 1.577 |
| 2.195973264859268 | 1.444 | 1.585 | 1.58 |
| 2.199114857512857 | 1.446 | 1.586 | 1.582 |
| 2.202256450166447 | 1.448 | 1.588 | 1.585 |
| 2.205398042820036 | 1.45 | 1.59 | 1.588 |
| 2.208539635473626 | 1.452 | 1.591 | 1.591 |
| 2.211681228127216 | 1.454 | 1.593 | 1.594 |
| 2.214822820780805 | 1.456 | 1.594 | 1.597 |
| 2.217964413434395 | 1.458 | 1.596 | 1.599 |
| 2.221106006087984 | 1.46 | 1.598 | 1.602 |
| 2.224247598741574 | 1.462 | 1.599 | 1.605 |
| 2.227389191395164 | 1.464 | 1.601 | 1.608 |
| 2.230530784048753 | 1.465 | 1.603 | 1.61 |
| 2.233672376702343 | 1.467 | 1.604 | 1.613 |
| 2.236813969355933 | 1.469 | 1.606 | 1.616 |
| 2.239955562009522 | 1.471 | 1.607 | 1.618 |
| 2.243097154663112 | 1.473 | 1.609 | 1.621 |
| 2.246238747316701 | 1.475 | 1.611 | 1.624 |
| 2.249380339970291 | 1.477 | 1.612 | 1.626 |
| 2.252521932623881 | 1.479 | 1.614 | 1.629 |
| 2.25566352527747 | 1.481 | 1.615 | 1.632 |
| 2.25880511793106 | 1.483 | 1.617 | 1.634 |
| 2.261946710584649 | 1.485 | 1.619 | 1.637 |
| 2.265088303238239 | 1.487 | 1.62 | 1.639 |
| 2.268229895891829 | 1.489 | 1.622 | 1.642 |
| 2.271371488545418 | 1.491 | 1.623 | 1.644 |
| 2.274513081199008 | 1.493 | 1.625 | 1.647 |
| 2.277654673852597 | 1.495 | 1.627 | 1.649 |
| 2.280796266506186 | 1.497 | 1.628 | 1.652 |
| 2.283937859159776 | 1.499 | 1.63 | 1.654 |
| 2.287079451813366 | 1.501 | 1.631 | 1.657 |
| 2.290221044466955 | 1.503 | 1.633 | 1.659 |
| 2.293362637120545 | 1.505 | 1.635 | 1.661 |
| 2.296504229774135 | 1.507 | 1.636 | 1.664 |
| 2.299645822427724 | 1.509 | 1.638 | 1.666 |
| 2.302787415081314 | 1.511 | 1.639 | 1.668 |
| 2.305929007734904 | 1.513 | 1.641 | 1.671 |
| 2.309070600388493 | 1.515 | 1.642 | 1.673 |
| 2.312212193042083 | 1.517 | 1.644 | 1.675 |
| 2.315353785695672 | 1.519 | 1.646 | 1.678 |
| 2.318495378349262 | 1.521 | 1.647 | 1.68 |
| 2.321636971002852 | 1.523 | 1.649 | 1.682 |
| 2.324778563656441 | 1.525 | 1.65 | 1.685 |
| 2.327920156310031 | 1.527 | 1.652 | 1.687 |
| 2.33106174896362 | 1.529 | 1.654 | 1.689 |
| 2.33420334161721 | 1.531 | 1.655 | 1.691 |
| 2.3373449342708 | 1.533 | 1.657 | 1.693 |
| 2.340486526924389 | 1.536 | 1.658 | 1.695 |
| 2.343628119577979 | 1.538 | 1.66 | 1.698 |
| 2.346769712231568 | 1.54 | 1.661 | 1.7 |
| 2.349911304885158 | 1.542 | 1.663 | 1.702 |
| 2.353052897538748 | 1.544 | 1.665 | 1.704 |
| 2.356194490192337 | 1.546 | 1.666 | 1.706 |
| 2.359336082845927 | 1.548 | 1.668 | 1.708 |
| 2.362477675499516 | 1.55 | 1.669 | 1.71 |
| 2.365619268153106 | 1.552 | 1.671 | 1.712 |
| 2.368760860806696 | 1.554 | 1.672 | 1.714 |
| 2.371902453460285 | 1.556 | 1.674 | 1.716 |
| 2.375044046113875 | 1.559 | 1.676 | 1.718 |
| 2.378185638767464 | 1.561 | 1.677 | 1.72 |
| 2.381327231421054 | 1.563 | 1.679 | 1.722 |
| 2.384468824074644 | 1.565 | 1.68 | 1.724 |
| 2.387610416728233 | 1.567 | 1.682 | 1.726 |
| 2.390752009381823 | 1.569 | 1.683 | 1.728 |
| 2.393893602035412 | 1.571 | 1.685 | 1.73 |
| 2.397035194689002 | 1.574 | 1.687 | 1.732 |
| 2.400176787342591 | 1.576 | 1.688 | 1.734 |
| 2.403318379996181 | 1.578 | 1.69 | 1.736 |
| 2.406459972649771 | 1.58 | 1.691 | 1.738 |
| 2.40960156530336 | 1.582 | 1.693 | 1.74 |
| 2.41274315795695 | 1.584 | 1.694 | 1.742 |
| 2.41588475061054 | 1.587 | 1.696 | 1.744 |
| 2.419026343264129 | 1.589 | 1.698 | 1.746 |
| 2.422167935917719 | 1.591 | 1.699 | 1.747 |
| 2.425309528571308 | 1.593 | 1.701 | 1.749 |
| 2.428451121224898 | 1.595 | 1.702 | 1.751 |
| 2.431592713878488 | 1.598 | 1.704 | 1.753 |
| 2.434734306532077 | 1.6 | 1.706 | 1.755 |
| 2.437875899185667 | 1.602 | 1.707 | 1.757 |
| 2.441017491839256 | 1.604 | 1.709 | 1.758 |
| 2.444159084492846 | 1.606 | 1.71 | 1.76 |
| 2.447300677146435 | 1.609 | 1.712 | 1.762 |
| 2.450442269800025 | 1.611 | 1.713 | 1.764 |
| 2.453583862453615 | 1.613 | 1.715 | 1.766 |
| 2.456725455107204 | 1.615 | 1.717 | 1.767 |
| 2.459867047760794 | 1.618 | 1.718 | 1.769 |
| 2.463008640414384 | 1.62 | 1.72 | 1.771 |
| 2.466150233067973 | 1.622 | 1.722 | 1.773 |
| 2.469291825721563 | 1.624 | 1.723 | 1.774 |
| 2.472433418375152 | 1.627 | 1.725 | 1.776 |
| 2.475575011028742 | 1.629 | 1.726 | 1.778 |
| 2.478716603682332 | 1.631 | 1.728 | 1.78 |
| 2.481858196335921 | 1.633 | 1.73 | 1.781 |
| 2.48499978898951 | 1.636 | 1.731 | 1.783 |
| 2.4881413816431 | 1.638 | 1.733 | 1.785 |
| 2.49128297429669 | 1.64 | 1.734 | 1.786 |
| 2.49442456695028 | 1.643 | 1.736 | 1.788 |
| 2.497566159603869 | 1.645 | 1.738 | 1.79 |
| 2.500707752257458 | 1.647 | 1.739 | 1.791 |
| 2.503849344911048 | 1.65 | 1.741 | 1.793 |
| 2.506990937564638 | 1.652 | 1.743 | 1.795 |
| 2.510132530218228 | 1.654 | 1.744 | 1.796 |
| 2.513274122871817 | 1.656 | 1.746 | 1.798 |
| 2.516415715525407 | 1.659 | 1.748 | 1.8 |
| 2.519557308178996 | 1.661 | 1.749 | 1.801 |
| 2.522698900832586 | 1.664 | 1.751 | 1.803 |
| 2.525840493486176 | 1.666 | 1.753 | 1.805 |
| 2.528982086139765 | 1.668 | 1.754 | 1.806 |
| 2.532123678793355 | 1.671 | 1.756 | 1.808 |
| 2.535265271446944 | 1.673 | 1.758 | 1.809 |
| 2.538406864100534 | 1.675 | 1.759 | 1.811 |
| 2.541548456754124 | 1.678 | 1.761 | 1.813 |
| 2.544690049407713 | 1.68 | 1.763 | 1.814 |
| 2.547831642061302 | 1.682 | 1.764 | 1.816 |
| 2.550973234714892 | 1.685 | 1.766 | 1.817 |
| 2.554114827368482 | 1.687 | 1.768 | 1.819 |
| 2.557256420022072 | 1.69 | 1.769 | 1.821 |
| 2.560398012675661 | 1.692 | 1.771 | 1.822 |
| 2.563539605329251 | 1.695 | 1.773 | 1.824 |
| 2.56668119798284 | 1.697 | 1.774 | 1.825 |
| 2.56982279063643 | 1.699 | 1.776 | 1.827 |
| 2.57296438329002 | 1.702 | 1.778 | 1.829 |
| 2.576105975943609 | 1.704 | 1.78 | 1.83 |
| 2.579247568597199 | 1.707 | 1.781 | 1.832 |
| 2.582389161250788 | 1.709 | 1.783 | 1.833 |
| 2.585530753904377 | 1.712 | 1.785 | 1.835 |
| 2.588672346557967 | 1.714 | 1.787 | 1.837 |
| 2.591813939211557 | 1.717 | 1.788 | 1.838 |
| 2.594955531865147 | 1.719 | 1.79 | 1.84 |
| 2.598097124518736 | 1.721 | 1.792 | 1.841 |
| 2.601238717172326 | 1.724 | 1.794 | 1.843 |
| 2.604380309825915 | 1.726 | 1.795 | 1.844 |
| 2.607521902479505 | 1.729 | 1.797 | 1.846 |
| 2.610663495133095 | 1.731 | 1.799 | 1.848 |
| 2.613805087786684 | 1.734 | 1.801 | 1.849 |
| 2.616946680440274 | 1.736 | 1.803 | 1.851 |
| 2.620088273093863 | 1.739 | 1.804 | 1.852 |
| 2.623229865747452 | 1.741 | 1.806 | 1.854 |
| 2.626371458401042 | 1.744 | 1.808 | 1.855 |
| 2.629513051054632 | 1.747 | 1.81 | 1.857 |
| 2.632654643708222 | 1.749 | 1.812 | 1.859 |
| 2.635796236361811 | 1.752 | 1.813 | 1.86 |
| 2.638937829015401 | 1.754 | 1.815 | 1.862 |
| 2.642079421668991 | 1.757 | 1.817 | 1.863 |
| 2.64522101432258 | 1.759 | 1.819 | 1.865 |
| 2.64836260697617 | 1.762 | 1.821 | 1.866 |
| 2.651504199629759 | 1.764 | 1.823 | 1.868 |
| 2.654645792283349 | 1.767 | 1.824 | 1.87 |
| 2.657787384936938 | 1.77 | 1.826 | 1.871 |
| 2.660928977590528 | 1.772 | 1.828 | 1.873 |
| 2.664070570244118 | 1.775 | 1.83 | 1.874 |
| 2.667212162897707 | 1.777 | 1.832 | 1.876 |
| 2.670353755551297 | 1.78 | 1.834 | 1.877 |
| 2.673495348204887 | 1.783 | 1.836 | 1.879 |
| 2.676636940858476 | 1.785 | 1.838 | 1.881 |
| 2.679778533512066 | 1.788 | 1.84 | 1.882 |
| 2.682920126165655 | 1.79 | 1.842 | 1.884 |
| 2.686061718819245 | 1.793 | 1.843 | 1.885 |
| 2.689203311472835 | 1.796 | 1.845 | 1.887 |
| 2.692344904126424 | 1.798 | 1.847 | 1.889 |
| 2.695486496780014 | 1.801 | 1.849 | 1.89 |
| 2.698628089433603 | 1.804 | 1.851 | 1.892 |
| 2.701769682087193 | 1.806 | 1.853 | 1.894 |
| 2.704911274740782 | 1.809 | 1.855 | 1.895 |
| 2.708052867394372 | 1.812 | 1.857 | 1.897 |
| 2.711194460047962 | 1.814 | 1.859 | 1.898 |
| 2.714336052701551 | 1.817 | 1.861 | 1.9 |
| 2.717477645355141 | 1.82 | 1.863 | 1.902 |
| 2.720619238008731 | 1.822 | 1.865 | 1.903 |
| 2.72376083066232 | 1.825 | 1.867 | 1.905 |
| 2.72690242331591 | 1.828 | 1.869 | 1.907 |
| 2.730044015969499 | 1.83 | 1.871 | 1.908 |
| 2.733185608623089 | 1.833 | 1.873 | 1.91 |
| 2.736327201276678 | 1.836 | 1.875 | 1.912 |
| 2.739468793930268 | 1.839 | 1.877 | 1.913 |
| 2.742610386583858 | 1.841 | 1.88 | 1.915 |
| 2.745751979237447 | 1.844 | 1.882 | 1.917 |
| 2.748893571891036 | 1.847 | 1.884 | 1.918 |
| 2.752035164544627 | 1.849 | 1.886 | 1.92 |
| 2.755176757198216 | 1.852 | 1.888 | 1.922 |
| 2.758318349851806 | 1.855 | 1.89 | 1.923 |
| 2.761459942505395 | 1.858 | 1.892 | 1.925 |
| 2.764601535158985 | 1.861 | 1.894 | 1.927 |
| 2.767743127812574 | 1.863 | 1.896 | 1.929 |
| 2.770884720466164 | 1.866 | 1.899 | 1.93 |
| 2.774026313119754 | 1.869 | 1.901 | 1.932 |
| 2.777167905773343 | 1.872 | 1.903 | 1.934 |
| 2.780309498426932 | 1.874 | 1.905 | 1.936 |
| 2.783451091080522 | 1.877 | 1.907 | 1.937 |
| 2.786592683734112 | 1.88 | 1.909 | 1.939 |
| 2.789734276387701 | 1.883 | 1.912 | 1.941 |
| 2.792875869041291 | 1.886 | 1.914 | 1.943 |
| 2.796017461694881 | 1.888 | 1.916 | 1.945 |
| 2.79915905434847 | 1.891 | 1.918 | 1.946 |
| 2.80230064700206 | 1.894 | 1.921 | 1.948 |
| 2.80544223965565 | 1.897 | 1.923 | 1.95 |
| 2.808583832309239 | 1.9 | 1.925 | 1.952 |
| 2.811725424962829 | 1.903 | 1.927 | 1.954 |
| 2.814867017616419 | 1.905 | 1.93 | 1.956 |
| 2.818008610270008 | 1.908 | 1.932 | 1.957 |
| 2.821150202923598 | 1.911 | 1.934 | 1.959 |
| 2.824291795577187 | 1.914 | 1.937 | 1.961 |
| 2.827433388230777 | 1.917 | 1.939 | 1.963 |
| 2.830574980884366 | 1.92 | 1.941 | 1.965 |
| 2.833716573537956 | 1.923 | 1.944 | 1.967 |
| 2.836858166191546 | 1.925 | 1.946 | 1.969 |
| 2.839999758845135 | 1.928 | 1.948 | 1.971 |
| 2.843141351498725 | 1.931 | 1.951 | 1.973 |
| 2.846282944152314 | 1.934 | 1.953 | 1.975 |
| 2.849424536805904 | 1.937 | 1.956 | 1.977 |
| 2.852566129459494 | 1.94 | 1.958 | 1.979 |
| 2.855707722113083 | 1.943 | 1.96 | 1.981 |
| 2.858849314766673 | 1.946 | 1.963 | 1.983 |
| 2.861990907420262 | 1.949 | 1.965 | 1.985 |
| 2.865132500073852 | 1.952 | 1.968 | 1.987 |
| 2.868274092727442 | 1.955 | 1.97 | 1.989 |
| 2.871415685381031 | 1.957 | 1.973 | 1.991 |
| 2.874557278034621 | 1.96 | 1.975 | 1.993 |
| 2.87769887068821 | 1.963 | 1.978 | 1.995 |
| 2.8808404633418 | 1.966 | 1.98 | 1.997 |
| 2.88398205599539 | 1.969 | 1.983 | 1.999 |
| 2.88712364864898 | 1.972 | 1.985 | 2.001 |
| 2.890265241302569 | 1.975 | 1.988 | 2.003 |
| 2.893406833956158 | 1.978 | 1.99 | 2.005 |
| 2.896548426609748 | 1.981 | 1.993 | 2.008 |
| 2.899690019263338 | 1.984 | 1.995 | 2.01 |
| 2.902831611916927 | 1.987 | 1.998 | 2.012 |
| 2.905973204570517 | 1.99 | 2.001 | 2.014 |
| 2.909114797224106 | 1.993 | 2.003 | 2.016 |
| 2.912256389877696 | 1.996 | 2.006 | 2.019 |
| 2.915397982531286 | 1.999 | 2.009 | 2.021 |
| 2.918539575184875 | 2.002 | 2.011 | 2.023 |
| 2.921681167838465 | 2.005 | 2.014 | 2.025 |
| 2.924822760492054 | 2.008 | 2.017 | 2.028 |
| 2.927964353145644 | 2.011 | 2.019 | 2.03 |
| 2.931105945799234 | 2.014 | 2.022 | 2.032 |
| 2.934247538452823 | 2.017 | 2.025 | 2.035 |
| 2.937389131106413 | 2.02 | 2.027 | 2.037 |
| 2.940530723760002 | 2.023 | 2.03 | 2.039 |
| 2.943672316413592 | 2.026 | 2.033 | 2.042 |
| 2.946813909067182 | 2.029 | 2.035 | 2.044 |
| 2.949955501720771 | 2.032 | 2.038 | 2.047 |
| 2.953097094374361 | 2.035 | 2.041 | 2.049 |
| 2.95623868702795 | 2.038 | 2.044 | 2.051 |
| 2.95938027968154 | 2.041 | 2.047 | 2.054 |
| 2.96252187233513 | 2.044 | 2.049 | 2.056 |
| 2.965663464988719 | 2.047 | 2.052 | 2.059 |
| 2.968805057642309 | 2.05 | 2.055 | 2.061 |
| 2.971946650295898 | 2.053 | 2.058 | 2.064 |
| 2.975088242949488 | 2.056 | 2.061 | 2.067 |
| 2.978229835603078 | 2.06 | 2.063 | 2.069 |
| 2.981371428256667 | 2.063 | 2.066 | 2.072 |
| 2.984513020910257 | 2.066 | 2.069 | 2.074 |
| 2.987654613563846 | 2.069 | 2.072 | 2.077 |
| 2.990796206217436 | 2.072 | 2.075 | 2.08 |
| 2.993937798871025 | 2.075 | 2.078 | 2.082 |
| 2.997079391524615 | 2.078 | 2.081 | 2.085 |
| 3.000220984178205 | 2.081 | 2.084 | 2.087 |
| 3.003362576831794 | 2.084 | 2.087 | 2.09 |
| 3.006504169485384 | 2.087 | 2.089 | 2.093 |
| 3.009645762138974 | 2.09 | 2.092 | 2.096 |
| 3.012787354792563 | 2.093 | 2.095 | 2.098 |
| 3.015928947446153 | 2.096 | 2.098 | 2.101 |
| 3.019070540099742 | 2.1 | 2.101 | 2.104 |
| 3.022212132753332 | 2.103 | 2.104 | 2.107 |
| 3.025353725406922 | 2.106 | 2.107 | 2.11 |
| 3.028495318060511 | 2.109 | 2.11 | 2.112 |
| 3.031636910714101 | 2.112 | 2.113 | 2.115 |
| 3.03477850336769 | 2.115 | 2.116 | 2.118 |
| 3.03792009602128 | 2.118 | 2.119 | 2.121 |
| 3.04106168867487 | 2.121 | 2.122 | 2.124 |
| 3.04420328132846 | 2.124 | 2.125 | 2.127 |
| 3.047344873982049 | 2.127 | 2.128 | 2.13 |
| 3.050486466635638 | 2.131 | 2.131 | 2.132 |
| 3.053628059289228 | 2.134 | 2.134 | 2.135 |
| 3.056769651942818 | 2.137 | 2.137 | 2.138 |
| 3.059911244596407 | 2.14 | 2.14 | 2.141 |
| 3.063052837249997 | 2.143 | 2.144 | 2.144 |
| 3.066194429903586 | 2.146 | 2.147 | 2.147 |
| 3.069336022557176 | 2.149 | 2.15 | 2.15 |
| 3.072477615210766 | 2.152 | 2.153 | 2.153 |
| 3.075619207864355 | 2.156 | 2.156 | 2.156 |
| 3.078760800517945 | 2.159 | 2.159 | 2.159 |
| 3.081902393171534 | 2.162 | 2.162 | 2.162 |
| 3.085043985825124 | 2.165 | 2.165 | 2.165 |
| 3.088185578478713 | 2.168 | 2.168 | 2.168 |
| 3.091327171132303 | 2.171 | 2.171 | 2.172 |
| 3.094468763785893 | 2.174 | 2.174 | 2.175 |
| 3.097610356439482 | 2.177 | 2.178 | 2.178 |
| 3.100751949093072 | 2.181 | 2.181 | 2.181 |
| 3.103893541746661 | 2.184 | 2.184 | 2.184 |
| 3.107035134400251 | 2.187 | 2.187 | 2.187 |
| 3.110176727053841 | 2.19 | 2.19 | 2.19 |
| 3.11331831970743 | 2.193 | 2.193 | 2.193 |
| 3.11645991236102 | 2.196 | 2.196 | 2.196 |
| 3.11960150501461 | 2.199 | 2.199 | 2.199 |
| 3.122743097668199 | 2.203 | 2.203 | 2.203 |
| 3.125884690321789 | 2.206 | 2.206 | 2.206 |
| 3.129026282975378 | 2.209 | 2.209 | 2.209 |
| 3.132167875628968 | 2.212 | 2.212 | 2.212 |
| 3.135309468282557 | 2.215 | 2.215 | 2.215 |
| 3.138451060936147 | 2.218 | 2.218 | 2.218 |
| 3.141592653589737 | 2.221 | 2.221 | 2.221 |
| 3.144734246243326 | 2.225 | 2.225 | 2.225 |
| 3.147875838896916 | 2.228 | 2.228 | 2.228 |
| 3.151017431550505 | 2.231 | 2.231 | 2.231 |
| 3.154159024204095 | 2.234 | 2.234 | 2.234 |
| 3.157300616857685 | 2.237 | 2.237 | 2.237 |
| 3.160442209511274 | 2.24 | 2.24 | 2.24 |
| 3.163583802164864 | 2.243 | 2.243 | 2.243 |
| 3.166725394818453 | 2.247 | 2.247 | 2.247 |
| 3.169866987472043 | 2.25 | 2.25 | 2.25 |
| 3.173008580125633 | 2.253 | 2.253 | 2.253 |
| 3.176150172779222 | 2.256 | 2.256 | 2.256 |
| 3.179291765432812 | 2.259 | 2.259 | 2.259 |
| 3.182433358086401 | 2.262 | 2.262 | 2.262 |
| 3.185574950739991 | 2.265 | 2.265 | 2.265 |
| 3.188716543393581 | 2.269 | 2.268 | 2.268 |
| 3.19185813604717 | 2.272 | 2.272 | 2.271 |
| 3.19499972870076 | 2.275 | 2.275 | 2.274 |
| 3.198141321354349 | 2.278 | 2.278 | 2.277 |
| 3.20128291400794 | 2.281 | 2.281 | 2.281 |
| 3.204424506661528 | 2.284 | 2.284 | 2.284 |
| 3.207566099315118 | 2.287 | 2.287 | 2.287 |
| 3.210707691968708 | 2.29 | 2.29 | 2.29 |
| 3.213849284622297 | 2.294 | 2.293 | 2.293 |
| 3.216990877275887 | 2.297 | 2.296 | 2.296 |
| 3.220132469929476 | 2.3 | 2.299 | 2.299 |
| 3.223274062583066 | 2.303 | 2.302 | 2.302 |
| 3.226415655236656 | 2.306 | 2.305 | 2.305 |
| 3.229557247890245 | 2.309 | 2.309 | 2.307 |
| 3.232698840543835 | 2.312 | 2.312 | 2.31 |
| 3.235840433197425 | 2.315 | 2.315 | 2.313 |
| 3.238982025851014 | 2.319 | 2.318 | 2.316 |
| 3.242123618504604 | 2.322 | 2.321 | 2.319 |
| 3.245265211158193 | 2.325 | 2.324 | 2.322 |
| 3.248406803811783 | 2.328 | 2.327 | 2.325 |
| 3.251548396465373 | 2.331 | 2.33 | 2.328 |
| 3.254689989118962 | 2.334 | 2.333 | 2.331 |
| 3.257831581772551 | 2.337 | 2.336 | 2.333 |
| 3.260973174426141 | 2.34 | 2.339 | 2.336 |
| 3.26411476707973 | 2.343 | 2.342 | 2.339 |
| 3.267256359733321 | 2.346 | 2.345 | 2.342 |
| 3.27039795238691 | 2.35 | 2.348 | 2.345 |
| 3.2735395450405 | 2.353 | 2.35 | 2.347 |
| 3.276681137694089 | 2.356 | 2.353 | 2.35 |
| 3.279822730347679 | 2.359 | 2.356 | 2.353 |
| 3.282964323001269 | 2.362 | 2.359 | 2.355 |
| 3.286105915654858 | 2.365 | 2.362 | 2.358 |
| 3.289247508308448 | 2.368 | 2.365 | 2.361 |
| 3.292389100962037 | 2.371 | 2.368 | 2.363 |
| 3.295530693615627 | 2.374 | 2.371 | 2.366 |
| 3.298672286269217 | 2.377 | 2.374 | 2.369 |
| 3.301813878922806 | 2.38 | 2.377 | 2.371 |
| 3.304955471576396 | 2.383 | 2.379 | 2.374 |
| 3.308097064229985 | 2.386 | 2.382 | 2.376 |
| 3.311238656883575 | 2.389 | 2.385 | 2.379 |
| 3.314380249537165 | 2.393 | 2.388 | 2.381 |
| 3.317521842190754 | 2.396 | 2.391 | 2.384 |
| 3.320663434844344 | 2.399 | 2.394 | 2.386 |
| 3.323805027497933 | 2.402 | 2.396 | 2.389 |
| 3.326946620151523 | 2.405 | 2.399 | 2.391 |
| 3.330088212805113 | 2.408 | 2.402 | 2.394 |
| 3.333229805458702 | 2.411 | 2.405 | 2.396 |
| 3.336371398112292 | 2.414 | 2.407 | 2.399 |
| 3.339512990765881 | 2.417 | 2.41 | 2.401 |
| 3.342654583419471 | 2.42 | 2.413 | 2.403 |
| 3.345796176073061 | 2.423 | 2.416 | 2.406 |
| 3.34893776872665 | 2.426 | 2.418 | 2.408 |
| 3.35207936138024 | 2.429 | 2.421 | 2.411 |
| 3.355220954033829 | 2.432 | 2.424 | 2.413 |
| 3.358362546687419 | 2.435 | 2.426 | 2.415 |
| 3.361504139341009 | 2.438 | 2.429 | 2.417 |
| 3.364645731994598 | 2.441 | 2.432 | 2.42 |
| 3.367787324648188 | 2.444 | 2.434 | 2.422 |
| 3.370928917301777 | 2.447 | 2.437 | 2.424 |
| 3.374070509955367 | 2.45 | 2.44 | 2.426 |
| 3.377212102608956 | 2.453 | 2.442 | 2.429 |
| 3.380353695262546 | 2.456 | 2.445 | 2.431 |
| 3.383495287916136 | 2.459 | 2.447 | 2.433 |
| 3.386636880569725 | 2.462 | 2.45 | 2.435 |
| 3.389778473223315 | 2.465 | 2.453 | 2.437 |
| 3.392920065876904 | 2.468 | 2.455 | 2.44 |
| 3.396061658530494 | 2.471 | 2.458 | 2.442 |
| 3.399203251184084 | 2.474 | 2.46 | 2.444 |
| 3.402344843837673 | 2.477 | 2.463 | 2.446 |
| 3.405486436491263 | 2.48 | 2.465 | 2.448 |
| 3.408628029144852 | 2.482 | 2.468 | 2.45 |
| 3.411769621798442 | 2.485 | 2.47 | 2.452 |
| 3.414911214452032 | 2.488 | 2.473 | 2.454 |
| 3.418052807105621 | 2.491 | 2.475 | 2.456 |
| 3.421194399759211 | 2.494 | 2.478 | 2.458 |
| 3.4243359924128 | 2.497 | 2.48 | 2.46 |
| 3.42747758506639 | 2.5 | 2.482 | 2.462 |
| 3.43061917771998 | 2.503 | 2.485 | 2.464 |
| 3.433760770373569 | 2.506 | 2.487 | 2.466 |
| 3.436902363027159 | 2.509 | 2.49 | 2.468 |
| 3.440043955680748 | 2.512 | 2.492 | 2.47 |
| 3.443185548334338 | 2.515 | 2.494 | 2.472 |
| 3.446327140987927 | 2.517 | 2.497 | 2.474 |
| 3.449468733641517 | 2.52 | 2.499 | 2.476 |
| 3.452610326295107 | 2.523 | 2.502 | 2.478 |
| 3.455751918948696 | 2.526 | 2.504 | 2.48 |
| 3.458893511602286 | 2.529 | 2.506 | 2.482 |
| 3.462035104255876 | 2.532 | 2.509 | 2.484 |
| 3.465176696909465 | 2.535 | 2.511 | 2.485 |
| 3.468318289563055 | 2.537 | 2.513 | 2.487 |
| 3.471459882216644 | 2.54 | 2.515 | 2.489 |
| 3.474601474870234 | 2.543 | 2.518 | 2.491 |
| 3.477743067523824 | 2.546 | 2.52 | 2.493 |
| 3.480884660177413 | 2.549 | 2.522 | 2.495 |
| 3.484026252831002 | 2.552 | 2.525 | 2.497 |
| 3.487167845484592 | 2.554 | 2.527 | 2.498 |
| 3.490309438138182 | 2.557 | 2.529 | 2.5 |
| 3.493451030791772 | 2.56 | 2.531 | 2.502 |
| 3.496592623445361 | 2.563 | 2.533 | 2.504 |
| 3.499734216098951 | 2.566 | 2.536 | 2.505 |
| 3.50287580875254 | 2.568 | 2.538 | 2.507 |
| 3.50601740140613 | 2.571 | 2.54 | 2.509 |
| 3.50915899405972 | 2.574 | 2.542 | 2.511 |
| 3.512300586713309 | 2.577 | 2.544 | 2.513 |
| 3.515442179366899 | 2.58 | 2.546 | 2.514 |
| 3.518583772020488 | 2.582 | 2.549 | 2.516 |
| 3.521725364674078 | 2.585 | 2.551 | 2.518 |
| 3.524866957327668 | 2.588 | 2.553 | 2.519 |
| 3.528008549981257 | 2.591 | 2.555 | 2.521 |
| 3.531150142634847 | 2.593 | 2.557 | 2.523 |
| 3.534291735288436 | 2.596 | 2.559 | 2.525 |
| 3.537433327942026 | 2.599 | 2.561 | 2.526 |
| 3.540574920595616 | 2.602 | 2.563 | 2.528 |
| 3.543716513249205 | 2.604 | 2.565 | 2.53 |
| 3.546858105902795 | 2.607 | 2.568 | 2.531 |
| 3.549999698556384 | 2.61 | 2.57 | 2.533 |
| 3.553141291209974 | 2.612 | 2.572 | 2.535 |
| 3.556282883863564 | 2.615 | 2.574 | 2.536 |
| 3.559424476517153 | 2.618 | 2.576 | 2.538 |
| 3.562566069170743 | 2.621 | 2.578 | 2.54 |
| 3.565707661824332 | 2.623 | 2.58 | 2.541 |
| 3.568849254477922 | 2.626 | 2.582 | 2.543 |
| 3.571990847131511 | 2.629 | 2.584 | 2.544 |
| 3.575132439785101 | 2.631 | 2.586 | 2.546 |
| 3.578274032438691 | 2.634 | 2.588 | 2.548 |
| 3.58141562509228 | 2.637 | 2.59 | 2.549 |
| 3.58455721774587 | 2.639 | 2.592 | 2.551 |
| 3.58769881039946 | 2.642 | 2.594 | 2.553 |
| 3.590840403053049 | 2.645 | 2.596 | 2.554 |
| 3.593981995706639 | 2.647 | 2.597 | 2.556 |
| 3.597123588360228 | 2.65 | 2.599 | 2.557 |
| 3.600265181013818 | 2.652 | 2.601 | 2.559 |
| 3.603406773667407 | 2.655 | 2.603 | 2.561 |
| 3.606548366320997 | 2.658 | 2.605 | 2.562 |
| 3.609689958974587 | 2.66 | 2.607 | 2.564 |
| 3.612831551628176 | 2.663 | 2.609 | 2.565 |
| 3.615973144281766 | 2.666 | 2.611 | 2.567 |
| 3.619114736935355 | 2.668 | 2.613 | 2.569 |
| 3.622256329588945 | 2.671 | 2.615 | 2.57 |
| 3.625397922242534 | 2.673 | 2.617 | 2.572 |
| 3.628539514896124 | 2.676 | 2.618 | 2.573 |
| 3.631681107549714 | 2.678 | 2.62 | 2.575 |
| 3.634822700203303 | 2.681 | 2.622 | 2.576 |
| 3.637964292856893 | 2.684 | 2.624 | 2.578 |
| 3.641105885510483 | 2.686 | 2.626 | 2.58 |
| 3.644247478164072 | 2.689 | 2.628 | 2.581 |
| 3.647389070817662 | 2.691 | 2.63 | 2.583 |
| 3.650530663471251 | 2.694 | 2.631 | 2.584 |
| 3.653672256124841 | 2.696 | 2.633 | 2.586 |
| 3.656813848778431 | 2.699 | 2.635 | 2.587 |
| 3.65995544143202 | 2.701 | 2.637 | 2.589 |
| 3.66309703408561 | 2.704 | 2.639 | 2.591 |
| 3.666238626739199 | 2.706 | 2.64 | 2.592 |
| 3.66938021939279 | 2.709 | 2.642 | 2.594 |
| 3.672521812046378 | 2.711 | 2.644 | 2.595 |
| 3.675663404699968 | 2.714 | 2.646 | 2.597 |
| 3.678804997353558 | 2.716 | 2.647 | 2.598 |
| 3.681946590007147 | 2.719 | 2.649 | 2.6 |
| 3.685088182660737 | 2.721 | 2.651 | 2.602 |
| 3.688229775314326 | 2.724 | 2.653 | 2.603 |
| 3.691371367967916 | 2.726 | 2.655 | 2.605 |
| 3.694512960621506 | 2.729 | 2.656 | 2.606 |
| 3.697654553275095 | 2.731 | 2.658 | 2.608 |
| 3.700796145928685 | 2.734 | 2.66 | 2.61 |
| 3.703937738582274 | 2.736 | 2.662 | 2.611 |
| 3.707079331235864 | 2.739 | 2.663 | 2.613 |
| 3.710220923889454 | 2.741 | 2.665 | 2.614 |
| 3.713362516543043 | 2.744 | 2.667 | 2.616 |
| 3.716504109196633 | 2.746 | 2.668 | 2.617 |
| 3.719645701850223 | 2.748 | 2.67 | 2.619 |
| 3.722787294503812 | 2.751 | 2.672 | 2.621 |
| 3.725928887157402 | 2.753 | 2.674 | 2.622 |
| 3.729070479810991 | 2.756 | 2.675 | 2.624 |
| 3.732212072464581 | 2.758 | 2.677 | 2.625 |
| 3.735353665118171 | 2.76 | 2.679 | 2.627 |
| 3.73849525777176 | 2.763 | 2.68 | 2.629 |
| 3.74163685042535 | 2.765 | 2.682 | 2.63 |
| 3.744778443078939 | 2.768 | 2.684 | 2.632 |
| 3.747920035732529 | 2.77 | 2.685 | 2.633 |
| 3.751061628386119 | 2.772 | 2.687 | 2.635 |
| 3.754203221039708 | 2.775 | 2.689 | 2.637 |
| 3.757344813693298 | 2.777 | 2.69 | 2.638 |
| 3.760486406346887 | 2.779 | 2.692 | 2.64 |
| 3.763627999000477 | 2.782 | 2.694 | 2.642 |
| 3.766769591654067 | 2.784 | 2.695 | 2.643 |
| 3.769911184307656 | 2.786 | 2.697 | 2.645 |
| 3.773052776961246 | 2.789 | 2.699 | 2.647 |
| 3.776194369614835 | 2.791 | 2.7 | 2.648 |
| 3.779335962268425 | 2.793 | 2.702 | 2.65 |
| 3.782477554922014 | 2.796 | 2.704 | 2.652 |
| 3.785619147575604 | 2.798 | 2.705 | 2.653 |
| 3.788760740229193 | 2.8 | 2.707 | 2.655 |
| 3.791902332882783 | 2.803 | 2.708 | 2.657 |
| 3.795043925536373 | 2.805 | 2.71 | 2.658 |
| 3.798185518189962 | 2.807 | 2.712 | 2.66 |
| 3.801327110843552 | 2.809 | 2.713 | 2.662 |
| 3.804468703497142 | 2.812 | 2.715 | 2.663 |
| 3.807610296150731 | 2.814 | 2.717 | 2.665 |
| 3.810751888804321 | 2.816 | 2.718 | 2.667 |
| 3.813893481457911 | 2.819 | 2.72 | 2.669 |
| 3.8170350741115 | 2.821 | 2.721 | 2.67 |
| 3.82017666676509 | 2.823 | 2.723 | 2.672 |
| 3.823318259418679 | 2.825 | 2.725 | 2.674 |
| 3.826459852072269 | 2.828 | 2.726 | 2.676 |
| 3.829601444725859 | 2.83 | 2.728 | 2.677 |
| 3.832743037379448 | 2.832 | 2.729 | 2.679 |
| 3.835884630033038 | 2.834 | 2.731 | 2.681 |
| 3.839026222686627 | 2.837 | 2.733 | 2.683 |
| 3.842167815340217 | 2.839 | 2.734 | 2.684 |
| 3.845309407993807 | 2.841 | 2.736 | 2.686 |
| 3.848451000647396 | 2.843 | 2.737 | 2.688 |
| 3.851592593300986 | 2.845 | 2.739 | 2.69 |
| 3.854734185954575 | 2.848 | 2.741 | 2.692 |
| 3.857875778608165 | 2.85 | 2.742 | 2.694 |
| 3.861017371261755 | 2.852 | 2.744 | 2.695 |
| 3.864158963915344 | 2.854 | 2.745 | 2.697 |
| 3.867300556568933 | 2.856 | 2.747 | 2.699 |
| 3.870442149222523 | 2.859 | 2.748 | 2.701 |
| 3.873583741876112 | 2.861 | 2.75 | 2.703 |
| 3.876725334529703 | 2.863 | 2.752 | 2.705 |
| 3.879866927183292 | 2.865 | 2.753 | 2.707 |
| 3.883008519836882 | 2.867 | 2.755 | 2.709 |
| 3.886150112490471 | 2.869 | 2.756 | 2.711 |
| 3.889291705144061 | 2.871 | 2.758 | 2.713 |
| 3.892433297797651 | 2.874 | 2.76 | 2.714 |
| 3.89557489045124 | 2.876 | 2.761 | 2.716 |
| 3.89871648310483 | 2.878 | 2.763 | 2.718 |
| 3.901858075758419 | 2.88 | 2.764 | 2.72 |
| 3.904999668412009 | 2.882 | 2.766 | 2.722 |
| 3.908141261065598 | 2.884 | 2.767 | 2.724 |
| 3.911282853719188 | 2.886 | 2.769 | 2.726 |
| 3.914424446372778 | 2.889 | 2.771 | 2.728 |
| 3.917566039026367 | 2.891 | 2.772 | 2.731 |
| 3.920707631679957 | 2.893 | 2.774 | 2.733 |
| 3.923849224333547 | 2.895 | 2.775 | 2.735 |
| 3.926990816987136 | 2.897 | 2.777 | 2.737 |
| 3.930132409640726 | 2.899 | 2.778 | 2.739 |
| 3.933274002294315 | 2.901 | 2.78 | 2.741 |
| 3.936415594947905 | 2.903 | 2.782 | 2.743 |
| 3.939557187601495 | 2.905 | 2.783 | 2.745 |
| 3.942698780255084 | 2.907 | 2.785 | 2.747 |
| 3.945840372908674 | 2.909 | 2.786 | 2.75 |
| 3.948981965562263 | 2.912 | 2.788 | 2.752 |
| 3.952123558215853 | 2.914 | 2.789 | 2.754 |
| 3.955265150869442 | 2.916 | 2.791 | 2.756 |
| 3.958406743523032 | 2.918 | 2.793 | 2.758 |
| 3.961548336176622 | 2.92 | 2.794 | 2.761 |
| 3.964689928830211 | 2.922 | 2.796 | 2.763 |
| 3.967831521483801 | 2.924 | 2.797 | 2.765 |
| 3.97097311413739 | 2.926 | 2.799 | 2.767 |
| 3.97411470679098 | 2.928 | 2.8 | 2.77 |
| 3.97725629944457 | 2.93 | 2.802 | 2.772 |
| 3.98039789209816 | 2.932 | 2.804 | 2.774 |
| 3.983539484751749 | 2.934 | 2.805 | 2.777 |
| 3.986681077405338 | 2.936 | 2.807 | 2.779 |
| 3.989822670058928 | 2.938 | 2.808 | 2.781 |
| 3.992964262712517 | 2.94 | 2.81 | 2.784 |
| 3.996105855366107 | 2.942 | 2.811 | 2.786 |
| 3.999247448019697 | 2.944 | 2.813 | 2.789 |
| 4.002389040673287 | 2.946 | 2.815 | 2.791 |
| 4.005530633326877 | 2.948 | 2.816 | 2.794 |
| 4.008672225980466 | 2.95 | 2.818 | 2.796 |
| 4.011813818634056 | 2.952 | 2.819 | 2.799 |
| 4.014955411287645 | 2.954 | 2.821 | 2.801 |
| 4.018097003941234 | 2.956 | 2.823 | 2.804 |
| 4.021238596594824 | 2.958 | 2.824 | 2.806 |
| 4.024380189248414 | 2.96 | 2.826 | 2.809 |
| 4.027521781902004 | 2.962 | 2.827 | 2.811 |
| 4.030663374555593 | 2.964 | 2.829 | 2.814 |
| 4.033804967209183 | 2.966 | 2.831 | 2.816 |
| 4.036946559862773 | 2.968 | 2.832 | 2.819 |
| 4.040088152516362 | 2.97 | 2.834 | 2.822 |
| 4.043229745169951 | 2.972 | 2.835 | 2.824 |
| 4.046371337823541 | 2.974 | 2.837 | 2.827 |
| 4.049512930477131 | 2.975 | 2.839 | 2.83 |
| 4.05265452313072 | 2.977 | 2.84 | 2.832 |
| 4.05579611578431 | 2.979 | 2.842 | 2.835 |
| 4.0589377084379 | 2.981 | 2.844 | 2.838 |
| 4.062079301091489 | 2.983 | 2.845 | 2.841 |
| 4.065220893745079 | 2.985 | 2.847 | 2.843 |
| 4.068362486398668 | 2.987 | 2.848 | 2.846 |
| 4.071504079052258 | 2.989 | 2.85 | 2.849 |
| 4.074645671705848 | 2.991 | 2.852 | 2.852 |
| 4.077787264359437 | 2.993 | 2.853 | 2.855 |
| 4.080928857013027 | 2.995 | 2.855 | 2.858 |
| 4.084070449666616 | 2.997 | 2.857 | 2.86 |
| 4.087212042320206 | 2.998 | 2.858 | 2.863 |
| 4.090353634973795 | 3 | 2.86 | 2.866 |
| 4.093495227627385 | 3.002 | 2.862 | 2.869 |
| 4.096636820280975 | 3.004 | 2.863 | 2.872 |
| 4.099778412934564 | 3.006 | 2.865 | 2.875 |
| 4.102920005588154 | 3.008 | 2.867 | 2.878 |
| 4.106061598241744 | 3.01 | 2.868 | 2.881 |
| 4.109203190895333 | 3.012 | 2.87 | 2.884 |
| 4.112344783548923 | 3.014 | 2.872 | 2.887 |
| 4.115486376202512 | 3.015 | 2.873 | 2.89 |
| 4.118627968856102 | 3.017 | 2.875 | 2.893 |
| 4.121769561509692 | 3.019 | 2.877 | 2.896 |
| 4.124911154163281 | 3.021 | 2.878 | 2.899 |
| 4.128052746816871 | 3.023 | 2.88 | 2.902 |
| 4.13119433947046 | 3.025 | 2.882 | 2.905 |
| 4.13433593212405 | 3.027 | 2.883 | 2.908 |
| 4.13747752477764 | 3.028 | 2.885 | 2.911 |
| 4.14061911743123 | 3.03 | 2.887 | 2.914 |
| 4.143760710084818 | 3.032 | 2.889 | 2.917 |
| 4.146902302738408 | 3.034 | 2.89 | 2.92 |
| 4.150043895391998 | 3.036 | 2.892 | 2.923 |
| 4.153185488045588 | 3.038 | 2.894 | 2.926 |
| 4.156327080699177 | 3.039 | 2.896 | 2.93 |
| 4.159468673352766 | 3.041 | 2.897 | 2.933 |
| 4.162610266006356 | 3.043 | 2.899 | 2.936 |
| 4.165751858659946 | 3.045 | 2.901 | 2.939 |
| 4.168893451313535 | 3.047 | 2.903 | 2.942 |
| 4.172035043967125 | 3.048 | 2.904 | 2.945 |
| 4.175176636620715 | 3.05 | 2.906 | 2.948 |
| 4.178318229274304 | 3.052 | 2.908 | 2.951 |
| 4.181459821927894 | 3.054 | 2.91 | 2.955 |
| 4.184601414581484 | 3.056 | 2.911 | 2.958 |
| 4.187743007235073 | 3.057 | 2.913 | 2.961 |
| 4.190884599888663 | 3.059 | 2.915 | 2.964 |
| 4.194026192542252 | 3.061 | 2.917 | 2.967 |
| 4.197167785195842 | 3.063 | 2.919 | 2.97 |
| 4.200309377849432 | 3.065 | 2.92 | 2.973 |
| 4.203450970503021 | 3.066 | 2.922 | 2.977 |
| 4.206592563156611 | 3.068 | 2.924 | 2.98 |
| 4.2097341558102 | 3.07 | 2.926 | 2.983 |
| 4.21287574846379 | 3.072 | 2.928 | 2.986 |
| 4.21601734111738 | 3.074 | 2.93 | 2.989 |
| 4.21915893377097 | 3.075 | 2.931 | 2.992 |
| 4.222300526424559 | 3.077 | 2.933 | 2.995 |
| 4.225442119078148 | 3.079 | 2.935 | 2.998 |
| 4.228583711731738 | 3.081 | 2.937 | 3.002 |
| 4.231725304385327 | 3.082 | 2.939 | 3.005 |
| 4.234866897038917 | 3.084 | 2.941 | 3.008 |
| 4.238008489692506 | 3.086 | 2.943 | 3.011 |
| 4.241150082346096 | 3.088 | 2.945 | 3.014 |
| 4.244291674999685 | 3.089 | 2.946 | 3.017 |
| 4.247433267653276 | 3.091 | 2.948 | 3.02 |
| 4.250574860306865 | 3.093 | 2.95 | 3.023 |
| 4.253716452960455 | 3.095 | 2.952 | 3.026 |
| 4.256858045614044 | 3.096 | 2.954 | 3.029 |
| 4.259999638267634 | 3.098 | 2.956 | 3.032 |
| 4.263141230921224 | 3.1 | 2.958 | 3.035 |
| 4.266282823574813 | 3.102 | 2.96 | 3.038 |
| 4.269424416228403 | 3.103 | 2.962 | 3.041 |
| 4.272566008881992 | 3.105 | 2.964 | 3.044 |
| 4.275707601535582 | 3.107 | 2.966 | 3.047 |
| 4.27884919418917 | 3.108 | 2.968 | 3.05 |
| 4.28199078684276 | 3.11 | 2.97 | 3.053 |
| 4.285132379496351 | 3.112 | 2.972 | 3.056 |
| 4.28827397214994 | 3.114 | 2.974 | 3.059 |
| 4.29141556480353 | 3.115 | 2.976 | 3.062 |
| 4.294557157457119 | 3.117 | 2.978 | 3.064 |
| 4.29769875011071 | 3.119 | 2.98 | 3.067 |
| 4.300840342764299 | 3.12 | 2.982 | 3.07 |
| 4.303981935417888 | 3.122 | 2.984 | 3.073 |
| 4.307123528071478 | 3.124 | 2.986 | 3.076 |
| 4.310265120725067 | 3.126 | 2.988 | 3.079 |
| 4.313406713378657 | 3.127 | 2.99 | 3.081 |
| 4.316548306032247 | 3.129 | 2.992 | 3.084 |
| 4.319689898685836 | 3.131 | 2.994 | 3.087 |
| 4.322831491339426 | 3.132 | 2.997 | 3.09 |
| 4.325973083993015 | 3.134 | 2.999 | 3.092 |
| 4.329114676646605 | 3.136 | 3.001 | 3.095 |
| 4.332256269300195 | 3.137 | 3.003 | 3.098 |
| 4.335397861953784 | 3.139 | 3.005 | 3.1 |
| 4.338539454607374 | 3.141 | 3.007 | 3.103 |
| 4.341681047260963 | 3.143 | 3.009 | 3.106 |
| 4.344822639914553 | 3.144 | 3.011 | 3.108 |
| 4.347964232568143 | 3.146 | 3.014 | 3.111 |
| 4.351105825221732 | 3.148 | 3.016 | 3.113 |
| 4.354247417875322 | 3.149 | 3.018 | 3.116 |
| 4.357389010528911 | 3.151 | 3.02 | 3.119 |
| 4.360530603182501 | 3.153 | 3.022 | 3.121 |
| 4.36367219583609 | 3.154 | 3.025 | 3.124 |
| 4.36681378848968 | 3.156 | 3.027 | 3.126 |
| 4.36995538114327 | 3.158 | 3.029 | 3.129 |
| 4.373096973796859 | 3.159 | 3.031 | 3.131 |
| 4.376238566450449 | 3.161 | 3.034 | 3.134 |
| 4.379380159104038 | 3.163 | 3.036 | 3.136 |
| 4.382521751757628 | 3.164 | 3.038 | 3.138 |
| 4.385663344411217 | 3.166 | 3.04 | 3.141 |
| 4.388804937064807 | 3.168 | 3.043 | 3.143 |
| 4.391946529718397 | 3.169 | 3.045 | 3.146 |
| 4.395088122371987 | 3.171 | 3.047 | 3.148 |
| 4.398229715025576 | 3.172 | 3.05 | 3.15 |
| 4.401371307679165 | 3.174 | 3.052 | 3.153 |
| 4.404512900332755 | 3.176 | 3.054 | 3.155 |
| 4.407654492986345 | 3.177 | 3.057 | 3.157 |
| 4.410796085639934 | 3.179 | 3.059 | 3.159 |
| 4.413937678293524 | 3.181 | 3.061 | 3.162 |
| 4.417079270947114 | 3.182 | 3.064 | 3.164 |
| 4.420220863600703 | 3.184 | 3.066 | 3.166 |
| 4.423362456254293 | 3.186 | 3.069 | 3.168 |
| 4.426504048907883 | 3.187 | 3.071 | 3.171 |
| 4.429645641561472 | 3.189 | 3.074 | 3.173 |
| 4.432787234215062 | 3.191 | 3.076 | 3.175 |
| 4.435928826868651 | 3.192 | 3.078 | 3.177 |
| 4.43907041952224 | 3.194 | 3.081 | 3.179 |
| 4.44221201217583 | 3.195 | 3.083 | 3.181 |
| 4.44535360482942 | 3.197 | 3.086 | 3.184 |
| 4.44849519748301 | 3.199 | 3.088 | 3.186 |
| 4.4516367901366 | 3.2 | 3.091 | 3.188 |
| 4.454778382790188 | 3.202 | 3.093 | 3.19 |
| 4.457919975443779 | 3.204 | 3.096 | 3.192 |
| 4.461061568097368 | 3.205 | 3.099 | 3.194 |
| 4.464203160750958 | 3.207 | 3.101 | 3.196 |
| 4.467344753404547 | 3.208 | 3.104 | 3.198 |
| 4.470486346058137 | 3.21 | 3.106 | 3.2 |
| 4.473627938711726 | 3.212 | 3.109 | 3.202 |
| 4.476769531365316 | 3.213 | 3.111 | 3.204 |
| 4.479911124018905 | 3.215 | 3.114 | 3.206 |
| 4.483052716672495 | 3.216 | 3.117 | 3.208 |
| 4.486194309326085 | 3.218 | 3.119 | 3.21 |
| 4.489335901979674 | 3.22 | 3.122 | 3.212 |
| 4.492477494633264 | 3.221 | 3.125 | 3.214 |
| 4.495619087286854 | 3.223 | 3.127 | 3.216 |
| 4.498760679940443 | 3.225 | 3.13 | 3.218 |
| 4.501902272594033 | 3.226 | 3.133 | 3.22 |
| 4.505043865247622 | 3.228 | 3.135 | 3.222 |
| 4.508185457901212 | 3.229 | 3.138 | 3.223 |
| 4.511327050554801 | 3.231 | 3.141 | 3.225 |
| 4.514468643208391 | 3.233 | 3.143 | 3.227 |
| 4.517610235861981 | 3.234 | 3.146 | 3.229 |
| 4.520751828515571 | 3.236 | 3.149 | 3.231 |
| 4.52389342116916 | 3.237 | 3.152 | 3.233 |
| 4.52703501382275 | 3.239 | 3.154 | 3.235 |
| 4.530176606476339 | 3.241 | 3.157 | 3.236 |
| 4.533318199129928 | 3.242 | 3.16 | 3.238 |
| 4.536459791783518 | 3.244 | 3.163 | 3.24 |
| 4.539601384437108 | 3.245 | 3.166 | 3.242 |
| 4.542742977090698 | 3.247 | 3.168 | 3.244 |
| 4.545884569744287 | 3.249 | 3.171 | 3.245 |
| 4.549026162397876 | 3.25 | 3.174 | 3.247 |
| 4.552167755051466 | 3.252 | 3.177 | 3.249 |
| 4.555309347705056 | 3.253 | 3.18 | 3.251 |
| 4.558450940358646 | 3.255 | 3.183 | 3.252 |
| 4.561592533012235 | 3.256 | 3.186 | 3.254 |
| 4.564734125665825 | 3.258 | 3.189 | 3.256 |
| 4.567875718319415 | 3.26 | 3.191 | 3.258 |
| 4.571017310973004 | 3.261 | 3.194 | 3.259 |
| 4.574158903626594 | 3.263 | 3.197 | 3.261 |
| 4.577300496280183 | 3.264 | 3.2 | 3.263 |
| 4.580442088933772 | 3.266 | 3.203 | 3.264 |
| 4.583583681587362 | 3.268 | 3.206 | 3.266 |
| 4.586725274240952 | 3.269 | 3.209 | 3.268 |
| 4.589866866894542 | 3.271 | 3.212 | 3.27 |
| 4.593008459548131 | 3.272 | 3.215 | 3.271 |
| 4.596150052201721 | 3.274 | 3.218 | 3.273 |
| 4.59929164485531 | 3.275 | 3.221 | 3.275 |
| 4.6024332375089 | 3.277 | 3.224 | 3.276 |
| 4.60557483016249 | 3.279 | 3.227 | 3.278 |
| 4.608716422816079 | 3.28 | 3.23 | 3.279 |
| 4.611858015469668 | 3.282 | 3.233 | 3.281 |
| 4.614999608123258 | 3.283 | 3.236 | 3.283 |
| 4.618141200776848 | 3.285 | 3.239 | 3.284 |
| 4.621282793430437 | 3.287 | 3.242 | 3.286 |
| 4.624424386084027 | 3.288 | 3.245 | 3.288 |
| 4.627565978737617 | 3.29 | 3.248 | 3.289 |
| 4.630707571391206 | 3.291 | 3.251 | 3.291 |
| 4.633849164044795 | 3.293 | 3.254 | 3.293 |
| 4.636990756698386 | 3.294 | 3.257 | 3.294 |
| 4.640132349351975 | 3.296 | 3.26 | 3.296 |
| 4.643273942005564 | 3.298 | 3.263 | 3.297 |
| 4.646415534659154 | 3.299 | 3.267 | 3.299 |
| 4.649557127312744 | 3.301 | 3.27 | 3.301 |
| 4.652698719966334 | 3.302 | 3.273 | 3.302 |
| 4.655840312619923 | 3.304 | 3.276 | 3.304 |
| 4.658981905273513 | 3.305 | 3.279 | 3.305 |
| 4.662123497927102 | 3.307 | 3.282 | 3.307 |
| 4.665265090580692 | 3.309 | 3.285 | 3.309 |
| 4.668406683234282 | 3.31 | 3.288 | 3.31 |
| 4.671548275887871 | 3.312 | 3.291 | 3.312 |
| 4.674689868541461 | 3.313 | 3.295 | 3.313 |
| 4.67783146119505 | 3.315 | 3.298 | 3.315 |
| 4.68097305384864 | 3.316 | 3.301 | 3.316 |
| 4.68411464650223 | 3.318 | 3.304 | 3.318 |
| 4.687256239155819 | 3.32 | 3.307 | 3.32 |
| 4.690397831809409 | 3.321 | 3.31 | 3.321 |
| 4.693539424462998 | 3.323 | 3.313 | 3.323 |
| 4.696681017116588 | 3.324 | 3.316 | 3.324 |
| 4.699822609770177 | 3.326 | 3.32 | 3.326 |
| 4.702964202423767 | 3.327 | 3.323 | 3.327 |
| 4.706105795077356 | 3.329 | 3.326 | 3.329 |
| 4.709247387730946 | 3.331 | 3.329 | 3.331 |
| 4.712388980384535 | 3.332 | 3.332 | 3.332 |
| 4.715530573038126 | 3.334 | 3.335 | 3.334 |
| 4.718672165691715 | 3.335 | 3.338 | 3.335 |
| 4.721813758345305 | 3.337 | 3.342 | 3.337 |
| 4.724955350998894 | 3.338 | 3.345 | 3.338 |
| 4.728096943652484 | 3.34 | 3.348 | 3.34 |
| 4.731238536306074 | 3.342 | 3.351 | 3.342 |
| 4.734380128959663 | 3.343 | 3.354 | 3.343 |
| 4.737521721613253 | 3.345 | 3.357 | 3.345 |
| 4.740663314266842 | 3.346 | 3.36 | 3.346 |
| 4.743804906920432 | 3.348 | 3.364 | 3.348 |
| 4.74694649957402 | 3.349 | 3.367 | 3.349 |
| 4.750088092227611 | 3.351 | 3.37 | 3.351 |
| 4.7532296848812 | 3.353 | 3.373 | 3.353 |
| 4.75637127753479 | 3.354 | 3.376 | 3.354 |
| 4.75951287018838 | 3.356 | 3.379 | 3.356 |
| 4.76265446284197 | 3.357 | 3.382 | 3.357 |
| 4.765796055495559 | 3.359 | 3.385 | 3.359 |
| 4.768937648149149 | 3.36 | 3.388 | 3.361 |
| 4.772079240802738 | 3.362 | 3.392 | 3.362 |
| 4.775220833456327 | 3.364 | 3.395 | 3.364 |
| 4.778362426109917 | 3.365 | 3.398 | 3.365 |
| 4.781504018763507 | 3.367 | 3.401 | 3.367 |
| 4.784645611417097 | 3.368 | 3.404 | 3.369 |
| 4.787787204070686 | 3.37 | 3.407 | 3.37 |
| 4.790928796724275 | 3.371 | 3.41 | 3.372 |
| 4.794070389377865 | 3.373 | 3.413 | 3.373 |
| 4.797211982031455 | 3.375 | 3.416 | 3.375 |
| 4.800353574685045 | 3.376 | 3.419 | 3.377 |
| 4.803495167338634 | 3.378 | 3.422 | 3.378 |
| 4.806636759992224 | 3.379 | 3.425 | 3.38 |
| 4.809778352645814 | 3.381 | 3.428 | 3.382 |
| 4.812919945299403 | 3.383 | 3.431 | 3.383 |
| 4.816061537952993 | 3.384 | 3.434 | 3.385 |
| 4.819203130606582 | 3.386 | 3.437 | 3.386 |
| 4.822344723260172 | 3.387 | 3.44 | 3.388 |
| 4.825486315913761 | 3.389 | 3.443 | 3.39 |
| 4.828627908567351 | 3.39 | 3.446 | 3.391 |
| 4.83176950122094 | 3.392 | 3.449 | 3.393 |
| 4.83491109387453 | 3.394 | 3.452 | 3.395 |
| 4.83805268652812 | 3.395 | 3.455 | 3.397 |
| 4.841194279181709 | 3.397 | 3.458 | 3.398 |
| 4.844335871835299 | 3.398 | 3.461 | 3.4 |
| 4.847477464488889 | 3.4 | 3.464 | 3.402 |
| 4.850619057142478 | 3.401 | 3.467 | 3.403 |
| 4.853760649796068 | 3.403 | 3.47 | 3.405 |
| 4.856902242449657 | 3.405 | 3.473 | 3.407 |
| 4.860043835103247 | 3.406 | 3.476 | 3.408 |
| 4.863185427756837 | 3.408 | 3.479 | 3.41 |
| 4.866327020410426 | 3.409 | 3.482 | 3.412 |
| 4.869468613064015 | 3.411 | 3.484 | 3.414 |
| 4.872610205717605 | 3.413 | 3.487 | 3.415 |
| 4.875751798371195 | 3.414 | 3.49 | 3.417 |
| 4.878893391024784 | 3.416 | 3.493 | 3.419 |
| 4.882034983678374 | 3.417 | 3.496 | 3.421 |
| 4.885176576331964 | 3.419 | 3.499 | 3.423 |
| 4.888318168985553 | 3.421 | 3.501 | 3.424 |
| 4.891459761639143 | 3.422 | 3.504 | 3.426 |
| 4.894601354292733 | 3.424 | 3.507 | 3.428 |
| 4.897742946946322 | 3.425 | 3.51 | 3.43 |
| 4.900884539599912 | 3.427 | 3.513 | 3.432 |
| 4.904026132253501 | 3.429 | 3.515 | 3.433 |
| 4.907167724907091 | 3.43 | 3.518 | 3.435 |
| 4.91030931756068 | 3.432 | 3.521 | 3.437 |
| 4.91345091021427 | 3.433 | 3.524 | 3.439 |
| 4.91659250286786 | 3.435 | 3.526 | 3.441 |
| 4.91973409552145 | 3.437 | 3.529 | 3.443 |
| 4.922875688175039 | 3.438 | 3.532 | 3.445 |
| 4.926017280828628 | 3.44 | 3.534 | 3.447 |
| 4.929158873482218 | 3.441 | 3.537 | 3.448 |
| 4.932300466135808 | 3.443 | 3.54 | 3.45 |
| 4.935442058789397 | 3.445 | 3.542 | 3.452 |
| 4.938583651442987 | 3.446 | 3.545 | 3.454 |
| 4.941725244096576 | 3.448 | 3.548 | 3.456 |
| 4.944866836750166 | 3.449 | 3.55 | 3.458 |
| 4.948008429403755 | 3.451 | 3.553 | 3.46 |
| 4.951150022057345 | 3.453 | 3.556 | 3.462 |
| 4.954291614710935 | 3.454 | 3.558 | 3.464 |
| 4.957433207364524 | 3.456 | 3.561 | 3.466 |
| 4.960574800018114 | 3.458 | 3.563 | 3.468 |
| 4.963716392671704 | 3.459 | 3.566 | 3.47 |
| 4.966857985325293 | 3.461 | 3.568 | 3.472 |
| 4.969999577978883 | 3.462 | 3.571 | 3.474 |
| 4.973141170632472 | 3.464 | 3.573 | 3.477 |
| 4.976282763286062 | 3.466 | 3.576 | 3.479 |
| 4.979424355939651 | 3.467 | 3.578 | 3.481 |
| 4.982565948593241 | 3.469 | 3.581 | 3.483 |
| 4.985707541246831 | 3.471 | 3.583 | 3.485 |
| 4.98884913390042 | 3.472 | 3.586 | 3.487 |
| 4.99199072655401 | 3.474 | 3.588 | 3.489 |
| 4.9951323192076 | 3.475 | 3.591 | 3.491 |
| 4.99827391186119 | 3.477 | 3.593 | 3.494 |
| 5.00141550451478 | 3.479 | 3.596 | 3.496 |
| 5.004557097168369 | 3.48 | 3.598 | 3.498 |
| 5.007698689821958 | 3.482 | 3.6 | 3.5 |
| 5.010840282475548 | 3.484 | 3.603 | 3.503 |
| 5.013981875129137 | 3.485 | 3.605 | 3.505 |
| 5.017123467782727 | 3.487 | 3.608 | 3.507 |
| 5.020265060436317 | 3.489 | 3.61 | 3.509 |
| 5.023406653089906 | 3.49 | 3.612 | 3.512 |
| 5.026548245743496 | 3.492 | 3.615 | 3.514 |
| 5.029689838397085 | 3.494 | 3.617 | 3.516 |
| 5.032831431050674 | 3.495 | 3.619 | 3.519 |
| 5.035973023704264 | 3.497 | 3.622 | 3.521 |
| 5.039114616357854 | 3.498 | 3.624 | 3.524 |
| 5.042256209011444 | 3.5 | 3.626 | 3.526 |
| 5.045397801665033 | 3.502 | 3.628 | 3.528 |
| 5.048539394318622 | 3.503 | 3.631 | 3.531 |
| 5.051680986972213 | 3.505 | 3.633 | 3.533 |
| 5.054822579625802 | 3.507 | 3.635 | 3.536 |
| 5.057964172279392 | 3.508 | 3.637 | 3.538 |
| 5.061105764932981 | 3.51 | 3.64 | 3.541 |
| 5.064247357586571 | 3.512 | 3.642 | 3.543 |
| 5.067388950240161 | 3.513 | 3.644 | 3.546 |
| 5.07053054289375 | 3.515 | 3.646 | 3.548 |
| 5.07367213554734 | 3.517 | 3.649 | 3.551 |
| 5.07681372820093 | 3.518 | 3.651 | 3.553 |
| 5.079955320854519 | 3.52 | 3.653 | 3.556 |
| 5.083096913508108 | 3.522 | 3.655 | 3.559 |
| 5.086238506161698 | 3.524 | 3.657 | 3.561 |
| 5.089380098815288 | 3.525 | 3.659 | 3.564 |
| 5.092521691468877 | 3.527 | 3.661 | 3.567 |
| 5.095663284122466 | 3.529 | 3.664 | 3.569 |
| 5.098804876776057 | 3.53 | 3.666 | 3.572 |
| 5.101946469429646 | 3.532 | 3.668 | 3.575 |
| 5.105088062083236 | 3.534 | 3.67 | 3.578 |
| 5.108229654736825 | 3.535 | 3.672 | 3.58 |
| 5.111371247390415 | 3.537 | 3.674 | 3.583 |
| 5.114512840044005 | 3.539 | 3.676 | 3.586 |
| 5.117654432697594 | 3.54 | 3.678 | 3.589 |
| 5.120796025351184 | 3.542 | 3.68 | 3.591 |
| 5.123937618004773 | 3.544 | 3.682 | 3.594 |
| 5.127079210658363 | 3.546 | 3.684 | 3.597 |
| 5.130220803311953 | 3.547 | 3.686 | 3.6 |
| 5.133362395965542 | 3.549 | 3.688 | 3.603 |
| 5.136503988619131 | 3.551 | 3.69 | 3.606 |
| 5.13964558127272 | 3.552 | 3.692 | 3.609 |
| 5.142787173926311 | 3.554 | 3.694 | 3.611 |
| 5.1459287665799 | 3.556 | 3.696 | 3.614 |
| 5.14907035923349 | 3.558 | 3.698 | 3.617 |
| 5.15221195188708 | 3.559 | 3.7 | 3.62 |
| 5.15535354454067 | 3.561 | 3.702 | 3.623 |
| 5.158495137194259 | 3.563 | 3.704 | 3.626 |
| 5.161636729847848 | 3.564 | 3.706 | 3.629 |
| 5.164778322501438 | 3.566 | 3.708 | 3.632 |
| 5.167919915155028 | 3.568 | 3.71 | 3.635 |
| 5.171061507808617 | 3.57 | 3.712 | 3.638 |
| 5.174203100462206 | 3.571 | 3.714 | 3.641 |
| 5.177344693115796 | 3.573 | 3.716 | 3.644 |
| 5.180486285769386 | 3.575 | 3.718 | 3.647 |
| 5.183627878422976 | 3.577 | 3.72 | 3.65 |
| 5.186769471076565 | 3.578 | 3.722 | 3.654 |
| 5.189911063730155 | 3.58 | 3.724 | 3.657 |
| 5.193052656383744 | 3.582 | 3.725 | 3.66 |
| 5.196194249037334 | 3.584 | 3.727 | 3.663 |
| 5.199335841690924 | 3.585 | 3.729 | 3.666 |
| 5.202477434344513 | 3.587 | 3.731 | 3.669 |
| 5.205619026998103 | 3.589 | 3.733 | 3.672 |
| 5.208760619651692 | 3.591 | 3.735 | 3.675 |
| 5.211902212305282 | 3.593 | 3.737 | 3.678 |
| 5.215043804958871 | 3.594 | 3.738 | 3.681 |
| 5.218185397612461 | 3.596 | 3.74 | 3.685 |
| 5.221326990266051 | 3.598 | 3.742 | 3.688 |
| 5.22446858291964 | 3.6 | 3.744 | 3.691 |
| 5.22761017557323 | 3.601 | 3.746 | 3.694 |
| 5.23075176822682 | 3.603 | 3.747 | 3.697 |
| 5.23389336088041 | 3.605 | 3.749 | 3.7 |
| 5.237034953533999 | 3.607 | 3.751 | 3.703 |
| 5.240176546187588 | 3.609 | 3.753 | 3.707 |
| 5.243318138841178 | 3.61 | 3.755 | 3.71 |
| 5.246459731494767 | 3.612 | 3.756 | 3.713 |
| 5.249601324148357 | 3.614 | 3.758 | 3.716 |
| 5.252742916801947 | 3.616 | 3.76 | 3.719 |
| 5.255884509455536 | 3.618 | 3.762 | 3.722 |
| 5.259026102109125 | 3.619 | 3.764 | 3.725 |
| 5.262167694762715 | 3.621 | 3.765 | 3.729 |
| 5.265309287416305 | 3.623 | 3.767 | 3.732 |
| 5.268450880069895 | 3.625 | 3.769 | 3.735 |
| 5.271592472723484 | 3.627 | 3.77 | 3.738 |
| 5.274734065377074 | 3.629 | 3.772 | 3.741 |
| 5.277875658030664 | 3.63 | 3.774 | 3.744 |
| 5.281017250684253 | 3.632 | 3.776 | 3.747 |
| 5.284158843337843 | 3.634 | 3.777 | 3.75 |
| 5.287300435991432 | 3.636 | 3.779 | 3.753 |
| 5.290442028645022 | 3.638 | 3.781 | 3.756 |
| 5.293583621298612 | 3.64 | 3.783 | 3.759 |
| 5.296725213952201 | 3.641 | 3.784 | 3.762 |
| 5.299866806605791 | 3.643 | 3.786 | 3.766 |
| 5.30300839925938 | 3.645 | 3.788 | 3.769 |
| 5.30614999191297 | 3.647 | 3.789 | 3.772 |
| 5.30929158456656 | 3.649 | 3.791 | 3.775 |
| 5.312433177220149 | 3.651 | 3.793 | 3.778 |
| 5.315574769873739 | 3.653 | 3.794 | 3.781 |
| 5.318716362527328 | 3.655 | 3.796 | 3.784 |
| 5.321857955180918 | 3.656 | 3.798 | 3.786 |
| 5.324999547834508 | 3.658 | 3.799 | 3.789 |
| 5.328141140488097 | 3.66 | 3.801 | 3.792 |
| 5.331282733141686 | 3.662 | 3.803 | 3.795 |
| 5.334424325795276 | 3.664 | 3.804 | 3.798 |
| 5.337565918448866 | 3.666 | 3.806 | 3.801 |
| 5.340707511102456 | 3.668 | 3.808 | 3.804 |
| 5.343849103756045 | 3.67 | 3.809 | 3.807 |
| 5.346990696409634 | 3.672 | 3.811 | 3.81 |
| 5.350132289063224 | 3.673 | 3.813 | 3.812 |
| 5.353273881716814 | 3.675 | 3.814 | 3.815 |
| 5.356415474370403 | 3.677 | 3.816 | 3.818 |
| 5.359557067023993 | 3.679 | 3.818 | 3.821 |
| 5.362698659677583 | 3.681 | 3.819 | 3.824 |
| 5.365840252331172 | 3.683 | 3.821 | 3.826 |
| 5.368981844984762 | 3.685 | 3.822 | 3.829 |
| 5.372123437638351 | 3.687 | 3.824 | 3.832 |
| 5.375265030291941 | 3.689 | 3.826 | 3.835 |
| 5.378406622945531 | 3.691 | 3.827 | 3.837 |
| 5.38154821559912 | 3.693 | 3.829 | 3.84 |
| 5.38468980825271 | 3.695 | 3.83 | 3.843 |
| 5.387831400906299 | 3.697 | 3.832 | 3.845 |
| 5.39097299355989 | 3.699 | 3.834 | 3.848 |
| 5.394114586213479 | 3.701 | 3.835 | 3.85 |
| 5.397256178867068 | 3.702 | 3.837 | 3.853 |
| 5.400397771520657 | 3.704 | 3.839 | 3.856 |
| 5.403539364174247 | 3.706 | 3.84 | 3.858 |
| 5.406680956827837 | 3.708 | 3.842 | 3.861 |
| 5.409822549481426 | 3.71 | 3.843 | 3.863 |
| 5.412964142135016 | 3.712 | 3.845 | 3.866 |
| 5.416105734788605 | 3.714 | 3.846 | 3.868 |
| 5.419247327442195 | 3.716 | 3.848 | 3.871 |
| 5.422388920095785 | 3.718 | 3.85 | 3.873 |
| 5.425530512749375 | 3.72 | 3.851 | 3.876 |
| 5.428672105402964 | 3.722 | 3.853 | 3.878 |
| 5.431813698056554 | 3.724 | 3.854 | 3.88 |
| 5.434955290710143 | 3.726 | 3.856 | 3.883 |
| 5.438096883363733 | 3.728 | 3.858 | 3.885 |
| 5.441238476017322 | 3.73 | 3.859 | 3.888 |
| 5.444380068670912 | 3.732 | 3.861 | 3.89 |
| 5.447521661324502 | 3.734 | 3.862 | 3.892 |
| 5.450663253978091 | 3.736 | 3.864 | 3.895 |
| 5.453804846631681 | 3.738 | 3.866 | 3.897 |
| 5.456946439285271 | 3.741 | 3.867 | 3.899 |
| 5.46008803193886 | 3.743 | 3.869 | 3.901 |
| 5.46322962459245 | 3.745 | 3.87 | 3.904 |
| 5.466371217246039 | 3.747 | 3.872 | 3.906 |
| 5.46951280989963 | 3.749 | 3.873 | 3.908 |
| 5.472654402553218 | 3.751 | 3.875 | 3.91 |
| 5.475795995206808 | 3.753 | 3.877 | 3.913 |
| 5.478937587860398 | 3.755 | 3.878 | 3.915 |
| 5.482079180513987 | 3.757 | 3.88 | 3.917 |
| 5.485220773167577 | 3.759 | 3.881 | 3.919 |
| 5.488362365821166 | 3.761 | 3.883 | 3.921 |
| 5.491503958474756 | 3.763 | 3.884 | 3.923 |
| 5.494645551128346 | 3.765 | 3.886 | 3.925 |
| 5.497787143781935 | 3.767 | 3.888 | 3.928 |
| 5.500928736435525 | 3.769 | 3.889 | 3.93 |
| 5.504070329089115 | 3.772 | 3.891 | 3.932 |
| 5.507211921742704 | 3.774 | 3.892 | 3.934 |
| 5.510353514396294 | 3.776 | 3.894 | 3.936 |
| 5.513495107049883 | 3.778 | 3.895 | 3.938 |
| 5.516636699703473 | 3.78 | 3.897 | 3.94 |
| 5.519778292357062 | 3.782 | 3.899 | 3.942 |
| 5.522919885010652 | 3.784 | 3.9 | 3.944 |
| 5.526061477664242 | 3.786 | 3.902 | 3.946 |
| 5.529203070317831 | 3.789 | 3.903 | 3.948 |
| 5.532344662971421 | 3.791 | 3.905 | 3.95 |
| 5.535486255625011 | 3.793 | 3.906 | 3.952 |
| 5.5386278482786 | 3.795 | 3.908 | 3.954 |
| 5.54176944093219 | 3.797 | 3.91 | 3.956 |
| 5.544911033585779 | 3.799 | 3.911 | 3.958 |
| 5.54805262623937 | 3.801 | 3.913 | 3.96 |
| 5.551194218892959 | 3.804 | 3.914 | 3.961 |
| 5.554335811546548 | 3.806 | 3.916 | 3.963 |
| 5.557477404200137 | 3.808 | 3.917 | 3.965 |
| 5.560618996853727 | 3.81 | 3.919 | 3.967 |
| 5.563760589507317 | 3.812 | 3.921 | 3.969 |
| 5.566902182160906 | 3.815 | 3.922 | 3.971 |
| 5.570043774814496 | 3.817 | 3.924 | 3.973 |
| 5.573185367468086 | 3.819 | 3.925 | 3.974 |
| 5.576326960121675 | 3.821 | 3.927 | 3.976 |
| 5.579468552775264 | 3.823 | 3.929 | 3.978 |
| 5.582610145428854 | 3.826 | 3.93 | 3.98 |
| 5.585751738082444 | 3.828 | 3.932 | 3.982 |
| 5.588893330736034 | 3.83 | 3.933 | 3.983 |
| 5.592034923389623 | 3.832 | 3.935 | 3.985 |
| 5.595176516043213 | 3.834 | 3.937 | 3.987 |
| 5.598318108696803 | 3.837 | 3.938 | 3.989 |
| 5.601459701350392 | 3.839 | 3.94 | 3.991 |
| 5.604601294003982 | 3.841 | 3.941 | 3.992 |
| 5.607742886657571 | 3.843 | 3.943 | 3.994 |
| 5.610884479311161 | 3.846 | 3.945 | 3.996 |
| 5.61402607196475 | 3.848 | 3.946 | 3.998 |
| 5.61716766461834 | 3.85 | 3.948 | 3.999 |
| 5.62030925727193 | 3.853 | 3.949 | 4.001 |
| 5.623450849925519 | 3.855 | 3.951 | 4.003 |
| 5.626592442579109 | 3.857 | 3.953 | 4.004 |
| 5.629734035232698 | 3.859 | 3.954 | 4.006 |
| 5.632875627886288 | 3.862 | 3.956 | 4.008 |
| 5.636017220539878 | 3.864 | 3.958 | 4.009 |
| 5.639158813193467 | 3.866 | 3.959 | 4.011 |
| 5.642300405847057 | 3.869 | 3.961 | 4.013 |
| 5.645441998500646 | 3.871 | 3.962 | 4.014 |
| 5.648583591154236 | 3.873 | 3.964 | 4.016 |
| 5.651725183807825 | 3.876 | 3.966 | 4.018 |
| 5.654866776461415 | 3.878 | 3.967 | 4.019 |
| 5.658008369115005 | 3.88 | 3.969 | 4.021 |
| 5.661149961768594 | 3.883 | 3.971 | 4.023 |
| 5.664291554422184 | 3.885 | 3.972 | 4.024 |
| 5.667433147075774 | 3.887 | 3.974 | 4.026 |
| 5.670574739729363 | 3.89 | 3.976 | 4.028 |
| 5.673716332382953 | 3.892 | 3.977 | 4.029 |
| 5.676857925036542 | 3.894 | 3.979 | 4.031 |
| 5.679999517690132 | 3.897 | 3.981 | 4.032 |
| 5.683141110343721 | 3.899 | 3.982 | 4.034 |
| 5.686282702997311 | 3.902 | 3.984 | 4.036 |
| 5.689424295650901 | 3.904 | 3.986 | 4.037 |
| 5.69256588830449 | 3.906 | 3.987 | 4.039 |
| 5.69570748095808 | 3.909 | 3.989 | 4.041 |
| 5.69884907361167 | 3.911 | 3.991 | 4.042 |
| 5.701990666265259 | 3.914 | 3.993 | 4.044 |
| 5.705132258918849 | 3.916 | 3.994 | 4.045 |
| 5.708273851572438 | 3.918 | 3.996 | 4.047 |
| 5.711415444226028 | 3.921 | 3.998 | 4.048 |
| 5.714557036879618 | 3.923 | 3.999 | 4.05 |
| 5.717698629533207 | 3.926 | 4.001 | 4.052 |
| 5.720840222186797 | 3.928 | 4.003 | 4.053 |
| 5.723981814840386 | 3.931 | 4.005 | 4.055 |
| 5.727123407493976 | 3.933 | 4.006 | 4.056 |
| 5.730265000147565 | 3.935 | 4.008 | 4.058 |
| 5.733406592801155 | 3.938 | 4.01 | 4.06 |
| 5.736548185454744 | 3.94 | 4.012 | 4.061 |
| 5.739689778108334 | 3.943 | 4.013 | 4.063 |
| 5.742831370761924 | 3.945 | 4.015 | 4.064 |
| 5.745972963415514 | 3.948 | 4.017 | 4.066 |
| 5.749114556069103 | 3.95 | 4.019 | 4.067 |
| 5.752256148722693 | 3.953 | 4.02 | 4.069 |
| 5.755397741376282 | 3.955 | 4.022 | 4.071 |
| 5.758539334029872 | 3.958 | 4.024 | 4.072 |
| 5.761680926683462 | 3.96 | 4.026 | 4.074 |
| 5.764822519337051 | 3.963 | 4.028 | 4.075 |
| 5.767964111990641 | 3.965 | 4.029 | 4.077 |
| 5.77110570464423 | 3.968 | 4.031 | 4.078 |
| 5.77424729729782 | 3.971 | 4.033 | 4.08 |
| 5.77738888995141 | 3.973 | 4.035 | 4.082 |
| 5.780530482605 | 3.976 | 4.037 | 4.083 |
| 5.783672075258588 | 3.978 | 4.038 | 4.085 |
| 5.786813667912178 | 3.981 | 4.04 | 4.086 |
| 5.789955260565768 | 3.983 | 4.042 | 4.088 |
| 5.793096853219358 | 3.986 | 4.044 | 4.089 |
| 5.796238445872947 | 3.988 | 4.046 | 4.091 |
| 5.799380038526537 | 3.991 | 4.048 | 4.093 |
| 5.802521631180126 | 3.994 | 4.05 | 4.094 |
| 5.805663223833715 | 3.996 | 4.052 | 4.096 |
| 5.808804816487306 | 3.999 | 4.053 | 4.097 |
| 5.811946409140895 | 4.001 | 4.055 | 4.099 |
| 5.815088001794485 | 4.004 | 4.057 | 4.101 |
| 5.818229594448074 | 4.007 | 4.059 | 4.102 |
| 5.821371187101663 | 4.009 | 4.061 | 4.104 |
| 5.824512779755254 | 4.012 | 4.063 | 4.105 |
| 5.827654372408843 | 4.014 | 4.065 | 4.107 |
| 5.830795965062433 | 4.017 | 4.067 | 4.109 |
| 5.833937557716022 | 4.02 | 4.069 | 4.11 |
| 5.837079150369612 | 4.022 | 4.071 | 4.112 |
| 5.840220743023201 | 4.025 | 4.073 | 4.113 |
| 5.843362335676791 | 4.028 | 4.075 | 4.115 |
| 5.846503928330381 | 4.03 | 4.077 | 4.117 |
| 5.84964552098397 | 4.033 | 4.079 | 4.118 |
| 5.85278711363756 | 4.036 | 4.081 | 4.12 |
| 5.85592870629115 | 4.038 | 4.083 | 4.121 |
| 5.85907029894474 | 4.041 | 4.085 | 4.123 |
| 5.862211891598329 | 4.044 | 4.087 | 4.125 |
| 5.865353484251918 | 4.046 | 4.089 | 4.126 |
| 5.868495076905508 | 4.049 | 4.091 | 4.128 |
| 5.871636669559098 | 4.052 | 4.093 | 4.13 |
| 5.874778262212687 | 4.055 | 4.095 | 4.131 |
| 5.877919854866277 | 4.057 | 4.097 | 4.133 |
| 5.881061447519866 | 4.06 | 4.099 | 4.135 |
| 5.884203040173456 | 4.063 | 4.101 | 4.136 |
| 5.887344632827046 | 4.065 | 4.103 | 4.138 |
| 5.890486225480635 | 4.068 | 4.105 | 4.14 |
| 5.893627818134224 | 4.071 | 4.107 | 4.141 |
| 5.896769410787814 | 4.074 | 4.109 | 4.143 |
| 5.899911003441404 | 4.076 | 4.111 | 4.145 |
| 5.903052596094994 | 4.079 | 4.114 | 4.147 |
| 5.906194188748583 | 4.082 | 4.116 | 4.148 |
| 5.909335781402172 | 4.085 | 4.118 | 4.15 |
| 5.912477374055762 | 4.087 | 4.12 | 4.152 |
| 5.915618966709352 | 4.09 | 4.122 | 4.154 |
| 5.918760559362942 | 4.093 | 4.124 | 4.155 |
| 5.921902152016531 | 4.096 | 4.127 | 4.157 |
| 5.92504374467012 | 4.099 | 4.129 | 4.159 |
| 5.92818533732371 | 4.101 | 4.131 | 4.161 |
| 5.9313269299773 | 4.104 | 4.133 | 4.162 |
| 5.93446852263089 | 4.107 | 4.135 | 4.164 |
| 5.93761011528448 | 4.11 | 4.138 | 4.166 |
| 5.940751707938068 | 4.113 | 4.14 | 4.168 |
| 5.943893300591658 | 4.116 | 4.142 | 4.17 |
| 5.947034893245248 | 4.118 | 4.144 | 4.171 |
| 5.950176485898837 | 4.121 | 4.147 | 4.173 |
| 5.953318078552427 | 4.124 | 4.149 | 4.175 |
| 5.956459671206017 | 4.127 | 4.151 | 4.177 |
| 5.959601263859606 | 4.13 | 4.153 | 4.179 |
| 5.962742856513196 | 4.133 | 4.156 | 4.181 |
| 5.965884449166785 | 4.135 | 4.158 | 4.183 |
| 5.969026041820375 | 4.138 | 4.16 | 4.185 |
| 5.972167634473964 | 4.141 | 4.163 | 4.186 |
| 5.975309227127554 | 4.144 | 4.165 | 4.188 |
| 5.978450819781144 | 4.147 | 4.167 | 4.19 |
| 5.981592412434733 | 4.15 | 4.17 | 4.192 |
| 5.984734005088323 | 4.153 | 4.172 | 4.194 |
| 5.987875597741913 | 4.156 | 4.175 | 4.196 |
| 5.991017190395502 | 4.159 | 4.177 | 4.198 |
| 5.994158783049092 | 4.161 | 4.179 | 4.2 |
| 5.997300375702681 | 4.164 | 4.182 | 4.202 |
| 6.000441968356271 | 4.167 | 4.184 | 4.204 |
| 6.003583561009861 | 4.17 | 4.187 | 4.206 |
| 6.00672515366345 | 4.173 | 4.189 | 4.208 |
| 6.00986674631704 | 4.176 | 4.192 | 4.21 |
| 6.01300833897063 | 4.179 | 4.194 | 4.212 |
| 6.01614993162422 | 4.182 | 4.197 | 4.214 |
| 6.019291524277808 | 4.185 | 4.199 | 4.216 |
| 6.022433116931398 | 4.188 | 4.202 | 4.218 |
| 6.025574709584988 | 4.191 | 4.204 | 4.221 |
| 6.028716302238577 | 4.194 | 4.207 | 4.223 |
| 6.031857894892167 | 4.197 | 4.209 | 4.225 |
| 6.034999487545757 | 4.2 | 4.212 | 4.227 |
| 6.038141080199346 | 4.203 | 4.214 | 4.229 |
| 6.041282672852935 | 4.205 | 4.217 | 4.231 |
| 6.044424265506525 | 4.208 | 4.22 | 4.233 |
| 6.047565858160115 | 4.211 | 4.222 | 4.236 |
| 6.050707450813704 | 4.214 | 4.225 | 4.238 |
| 6.053849043467294 | 4.217 | 4.227 | 4.24 |
| 6.056990636120884 | 4.22 | 4.23 | 4.242 |
| 6.060132228774473 | 4.223 | 4.233 | 4.245 |
| 6.063273821428063 | 4.226 | 4.235 | 4.247 |
| 6.066415414081653 | 4.229 | 4.238 | 4.249 |
| 6.069557006735242 | 4.232 | 4.241 | 4.251 |
| 6.072698599388831 | 4.235 | 4.243 | 4.254 |
| 6.07584019204242 | 4.238 | 4.246 | 4.256 |
| 6.078981784696011 | 4.241 | 4.249 | 4.258 |
| 6.082123377349601 | 4.244 | 4.251 | 4.261 |
| 6.08526497000319 | 4.247 | 4.254 | 4.263 |
| 6.08840656265678 | 4.25 | 4.257 | 4.266 |
| 6.09154815531037 | 4.254 | 4.26 | 4.268 |
| 6.094689747963959 | 4.257 | 4.262 | 4.27 |
| 6.097831340617549 | 4.26 | 4.265 | 4.273 |
| 6.100972933271138 | 4.263 | 4.268 | 4.275 |
| 6.104114525924728 | 4.266 | 4.271 | 4.278 |
| 6.107256118578317 | 4.269 | 4.274 | 4.28 |
| 6.110397711231907 | 4.272 | 4.276 | 4.283 |
| 6.113539303885497 | 4.275 | 4.279 | 4.285 |
| 6.116680896539086 | 4.278 | 4.282 | 4.288 |
| 6.119822489192675 | 4.281 | 4.285 | 4.291 |
| 6.122964081846265 | 4.284 | 4.288 | 4.293 |
| 6.126105674499855 | 4.287 | 4.291 | 4.296 |
| 6.129247267153445 | 4.29 | 4.293 | 4.298 |
| 6.132388859807034 | 4.293 | 4.296 | 4.301 |
| 6.135530452460624 | 4.296 | 4.299 | 4.304 |
| 6.138672045114213 | 4.299 | 4.302 | 4.306 |
| 6.141813637767803 | 4.302 | 4.305 | 4.309 |
| 6.144955230421393 | 4.306 | 4.308 | 4.312 |
| 6.148096823074982 | 4.309 | 4.311 | 4.314 |
| 6.151238415728571 | 4.312 | 4.314 | 4.317 |
| 6.154380008382161 | 4.315 | 4.317 | 4.32 |
| 6.157521601035751 | 4.318 | 4.32 | 4.323 |
| 6.16066319368934 | 4.321 | 4.323 | 4.325 |
| 6.16380478634293 | 4.324 | 4.326 | 4.328 |
| 6.16694637899652 | 4.327 | 4.329 | 4.331 |
| 6.170087971650109 | 4.33 | 4.332 | 4.334 |
| 6.173229564303698 | 4.333 | 4.335 | 4.337 |
| 6.176371156957289 | 4.336 | 4.338 | 4.339 |
| 6.179512749610878 | 4.34 | 4.341 | 4.342 |
| 6.182654342264468 | 4.343 | 4.344 | 4.345 |
| 6.185795934918057 | 4.346 | 4.347 | 4.348 |
| 6.188937527571647 | 4.349 | 4.35 | 4.351 |
| 6.192079120225237 | 4.352 | 4.353 | 4.354 |
| 6.195220712878826 | 4.355 | 4.356 | 4.357 |
| 6.198362305532415 | 4.358 | 4.359 | 4.36 |
| 6.201503898186005 | 4.361 | 4.362 | 4.363 |
| 6.204645490839594 | 4.365 | 4.365 | 4.366 |
| 6.207787083493184 | 4.368 | 4.368 | 4.369 |
| 6.210928676146774 | 4.371 | 4.371 | 4.372 |
| 6.214070268800364 | 4.374 | 4.374 | 4.375 |
| 6.217211861453953 | 4.377 | 4.377 | 4.378 |
| 6.220353454107543 | 4.38 | 4.38 | 4.381 |
| 6.223495046761133 | 4.383 | 4.383 | 4.384 |
| 6.226636639414722 | 4.386 | 4.387 | 4.387 |
| 6.229778232068312 | 4.39 | 4.39 | 4.39 |
| 6.232919824721901 | 4.393 | 4.393 | 4.393 |
| 6.236061417375491 | 4.396 | 4.396 | 4.396 |
| 6.23920301002908 | 4.399 | 4.399 | 4.399 |
| 6.24234460268267 | 4.402 | 4.402 | 4.402 |
| 6.24548619533626 | 4.405 | 4.405 | 4.405 |
| 6.24862778798985 | 4.408 | 4.408 | 4.408 |
| 6.251769380643438 | 4.411 | 4.412 | 4.412 |
| 6.254910973297028 | 4.415 | 4.415 | 4.415 |
| 6.258052565950618 | 4.418 | 4.418 | 4.418 |
| 6.261194158604208 | 4.421 | 4.421 | 4.421 |
| 6.264335751257797 | 4.424 | 4.424 | 4.424 |
| 6.267477343911387 | 4.427 | 4.427 | 4.427 |
| 6.270618936564976 | 4.43 | 4.43 | 4.43 |
| 6.273760529218566 | 4.433 | 4.433 | 4.433 |
| 6.276902121872155 | 4.437 | 4.437 | 4.437 |
| 6.280043714525745 | 4.44 | 4.44 | 4.44 |
| 6.283185307179335 | 4.443 | 4.443 | 4.443 |